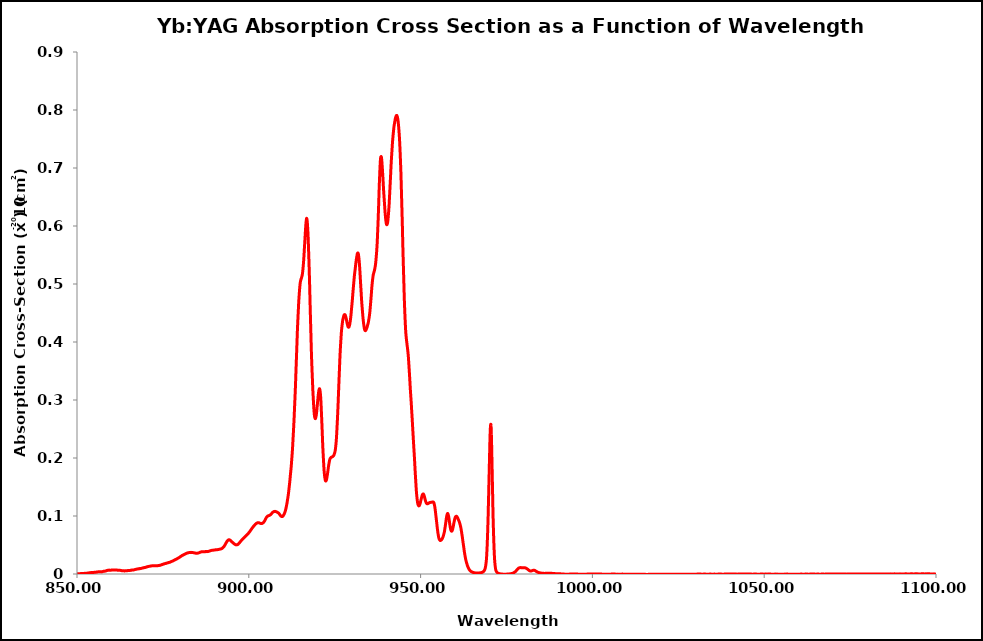
| Category | 80K |
|---|---|
| 850.0 | 0 |
| 850.05 | 0 |
| 850.1 | 0 |
| 850.15 | 0 |
| 850.2 | 0 |
| 850.25 | 0 |
| 850.3 | 0.001 |
| 850.35 | 0 |
| 850.4 | 0 |
| 850.45 | 0 |
| 850.5 | 0 |
| 850.55 | 0 |
| 850.6 | 0 |
| 850.65 | 0 |
| 850.7 | 0 |
| 850.75 | 0 |
| 850.8 | 0.001 |
| 850.85 | 0 |
| 850.9 | 0 |
| 850.95 | 0.001 |
| 851.0 | 0.001 |
| 851.05 | 0.001 |
| 851.1 | 0.001 |
| 851.15 | 0.001 |
| 851.2 | 0.001 |
| 851.25 | 0.001 |
| 851.3 | 0.001 |
| 851.35 | 0.001 |
| 851.4 | 0.001 |
| 851.45 | 0.001 |
| 851.5 | 0.001 |
| 851.55 | 0.001 |
| 851.6 | 0.001 |
| 851.65 | 0.001 |
| 851.7 | 0.001 |
| 851.75 | 0.001 |
| 851.8 | 0.001 |
| 851.85 | 0.001 |
| 851.9 | 0.001 |
| 851.95 | 0.001 |
| 852.0 | 0.001 |
| 852.05 | 0.001 |
| 852.1 | 0.001 |
| 852.15 | 0.001 |
| 852.2 | 0.001 |
| 852.25 | 0.001 |
| 852.3 | 0.001 |
| 852.35 | 0.001 |
| 852.4 | 0.001 |
| 852.45 | 0.001 |
| 852.5 | 0.001 |
| 852.55 | 0.001 |
| 852.6 | 0.001 |
| 852.65 | 0.001 |
| 852.7 | 0.001 |
| 852.75 | 0.001 |
| 852.8 | 0.001 |
| 852.85 | 0.001 |
| 852.9 | 0.001 |
| 852.95 | 0.001 |
| 853.0 | 0.001 |
| 853.05 | 0.001 |
| 853.1 | 0.002 |
| 853.15 | 0.002 |
| 853.2 | 0.002 |
| 853.25 | 0.002 |
| 853.3 | 0.002 |
| 853.35 | 0.002 |
| 853.4 | 0.002 |
| 853.45 | 0.002 |
| 853.5 | 0.002 |
| 853.55 | 0.002 |
| 853.6 | 0.002 |
| 853.65 | 0.002 |
| 853.7 | 0.002 |
| 853.75 | 0.002 |
| 853.8 | 0.002 |
| 853.85 | 0.002 |
| 853.9 | 0.002 |
| 853.95 | 0.002 |
| 854.0 | 0.002 |
| 854.05 | 0.002 |
| 854.1 | 0.002 |
| 854.15 | 0.002 |
| 854.2 | 0.002 |
| 854.25 | 0.002 |
| 854.3 | 0.003 |
| 854.35 | 0.002 |
| 854.4 | 0.002 |
| 854.45 | 0.002 |
| 854.5 | 0.002 |
| 854.55 | 0.002 |
| 854.6 | 0.003 |
| 854.65 | 0.003 |
| 854.7 | 0.002 |
| 854.75 | 0.003 |
| 854.8 | 0.003 |
| 854.85 | 0.003 |
| 854.9 | 0.003 |
| 854.95 | 0.003 |
| 855.0 | 0.003 |
| 855.05 | 0.003 |
| 855.1 | 0.003 |
| 855.15 | 0.003 |
| 855.2 | 0.003 |
| 855.25 | 0.003 |
| 855.3 | 0.003 |
| 855.35 | 0.003 |
| 855.4 | 0.003 |
| 855.45 | 0.003 |
| 855.5 | 0.003 |
| 855.55 | 0.003 |
| 855.6 | 0.003 |
| 855.65 | 0.003 |
| 855.7 | 0.003 |
| 855.75 | 0.003 |
| 855.8 | 0.003 |
| 855.85 | 0.004 |
| 855.9 | 0.003 |
| 855.95 | 0.004 |
| 856.0 | 0.004 |
| 856.05 | 0.004 |
| 856.1 | 0.004 |
| 856.15 | 0.004 |
| 856.2 | 0.004 |
| 856.25 | 0.004 |
| 856.3 | 0.004 |
| 856.35 | 0.004 |
| 856.4 | 0.004 |
| 856.45 | 0.004 |
| 856.5 | 0.004 |
| 856.55 | 0.004 |
| 856.6 | 0.004 |
| 856.65 | 0.004 |
| 856.7 | 0.004 |
| 856.75 | 0.004 |
| 856.8 | 0.004 |
| 856.85 | 0.004 |
| 856.9 | 0.004 |
| 856.95 | 0.004 |
| 857.0 | 0.004 |
| 857.05 | 0.004 |
| 857.1 | 0.004 |
| 857.15 | 0.004 |
| 857.2 | 0.004 |
| 857.25 | 0.004 |
| 857.3 | 0.004 |
| 857.35 | 0.004 |
| 857.4 | 0.004 |
| 857.45 | 0.004 |
| 857.5 | 0.004 |
| 857.55 | 0.004 |
| 857.6 | 0.004 |
| 857.65 | 0.004 |
| 857.7 | 0.005 |
| 857.75 | 0.005 |
| 857.8 | 0.005 |
| 857.85 | 0.005 |
| 857.9 | 0.005 |
| 857.95 | 0.005 |
| 858.0 | 0.005 |
| 858.05 | 0.005 |
| 858.1 | 0.005 |
| 858.15 | 0.005 |
| 858.2 | 0.005 |
| 858.25 | 0.005 |
| 858.3 | 0.005 |
| 858.35 | 0.005 |
| 858.4 | 0.005 |
| 858.45 | 0.005 |
| 858.5 | 0.006 |
| 858.55 | 0.006 |
| 858.6 | 0.006 |
| 858.65 | 0.006 |
| 858.7 | 0.006 |
| 858.75 | 0.006 |
| 858.8 | 0.006 |
| 858.85 | 0.006 |
| 858.9 | 0.006 |
| 858.95 | 0.006 |
| 859.0 | 0.007 |
| 859.05 | 0.007 |
| 859.1 | 0.006 |
| 859.15 | 0.007 |
| 859.2 | 0.007 |
| 859.25 | 0.007 |
| 859.3 | 0.007 |
| 859.35 | 0.007 |
| 859.4 | 0.007 |
| 859.45 | 0.007 |
| 859.5 | 0.007 |
| 859.55 | 0.007 |
| 859.6 | 0.007 |
| 859.65 | 0.007 |
| 859.7 | 0.006 |
| 859.75 | 0.007 |
| 859.8 | 0.007 |
| 859.85 | 0.007 |
| 859.9 | 0.007 |
| 859.95 | 0.007 |
| 860.0 | 0.007 |
| 860.05 | 0.007 |
| 860.1 | 0.007 |
| 860.15 | 0.007 |
| 860.2 | 0.007 |
| 860.25 | 0.007 |
| 860.3 | 0.007 |
| 860.35 | 0.007 |
| 860.4 | 0.007 |
| 860.45 | 0.007 |
| 860.5 | 0.007 |
| 860.55 | 0.007 |
| 860.6 | 0.007 |
| 860.65 | 0.007 |
| 860.7 | 0.007 |
| 860.75 | 0.007 |
| 860.8 | 0.007 |
| 860.85 | 0.007 |
| 860.9 | 0.007 |
| 860.95 | 0.007 |
| 861.0 | 0.007 |
| 861.05 | 0.007 |
| 861.1 | 0.007 |
| 861.15 | 0.007 |
| 861.2 | 0.007 |
| 861.25 | 0.007 |
| 861.3 | 0.007 |
| 861.35 | 0.007 |
| 861.4 | 0.007 |
| 861.45 | 0.007 |
| 861.5 | 0.007 |
| 861.55 | 0.007 |
| 861.6 | 0.007 |
| 861.65 | 0.007 |
| 861.7 | 0.007 |
| 861.75 | 0.007 |
| 861.8 | 0.007 |
| 861.85 | 0.007 |
| 861.9 | 0.007 |
| 861.95 | 0.007 |
| 862.0 | 0.007 |
| 862.05 | 0.007 |
| 862.1 | 0.007 |
| 862.15 | 0.006 |
| 862.2 | 0.006 |
| 862.25 | 0.006 |
| 862.3 | 0.006 |
| 862.35 | 0.006 |
| 862.4 | 0.006 |
| 862.45 | 0.006 |
| 862.5 | 0.006 |
| 862.55 | 0.006 |
| 862.6 | 0.006 |
| 862.65 | 0.006 |
| 862.7 | 0.006 |
| 862.75 | 0.006 |
| 862.8 | 0.006 |
| 862.85 | 0.006 |
| 862.9 | 0.006 |
| 862.95 | 0.006 |
| 863.0 | 0.006 |
| 863.05 | 0.006 |
| 863.1 | 0.006 |
| 863.15 | 0.006 |
| 863.2 | 0.006 |
| 863.25 | 0.006 |
| 863.3 | 0.006 |
| 863.35 | 0.006 |
| 863.4 | 0.006 |
| 863.45 | 0.006 |
| 863.5 | 0.005 |
| 863.55 | 0.005 |
| 863.6 | 0.005 |
| 863.65 | 0.005 |
| 863.7 | 0.005 |
| 863.75 | 0.005 |
| 863.8 | 0.005 |
| 863.85 | 0.005 |
| 863.9 | 0.005 |
| 863.95 | 0.005 |
| 864.0 | 0.006 |
| 864.05 | 0.006 |
| 864.1 | 0.005 |
| 864.15 | 0.005 |
| 864.2 | 0.005 |
| 864.25 | 0.005 |
| 864.3 | 0.005 |
| 864.35 | 0.005 |
| 864.4 | 0.006 |
| 864.45 | 0.006 |
| 864.5 | 0.006 |
| 864.55 | 0.006 |
| 864.6 | 0.006 |
| 864.65 | 0.006 |
| 864.7 | 0.006 |
| 864.75 | 0.006 |
| 864.8 | 0.006 |
| 864.85 | 0.006 |
| 864.9 | 0.006 |
| 864.95 | 0.006 |
| 865.0 | 0.006 |
| 865.05 | 0.006 |
| 865.1 | 0.006 |
| 865.15 | 0.006 |
| 865.2 | 0.006 |
| 865.25 | 0.006 |
| 865.3 | 0.006 |
| 865.35 | 0.006 |
| 865.4 | 0.006 |
| 865.45 | 0.006 |
| 865.5 | 0.006 |
| 865.55 | 0.006 |
| 865.6 | 0.006 |
| 865.65 | 0.006 |
| 865.7 | 0.006 |
| 865.75 | 0.007 |
| 865.8 | 0.007 |
| 865.85 | 0.007 |
| 865.9 | 0.007 |
| 865.95 | 0.007 |
| 866.0 | 0.007 |
| 866.05 | 0.007 |
| 866.1 | 0.007 |
| 866.15 | 0.007 |
| 866.2 | 0.007 |
| 866.25 | 0.007 |
| 866.3 | 0.007 |
| 866.35 | 0.007 |
| 866.4 | 0.007 |
| 866.45 | 0.007 |
| 866.5 | 0.007 |
| 866.55 | 0.007 |
| 866.6 | 0.007 |
| 866.65 | 0.007 |
| 866.7 | 0.007 |
| 866.75 | 0.007 |
| 866.8 | 0.008 |
| 866.85 | 0.008 |
| 866.9 | 0.008 |
| 866.95 | 0.008 |
| 867.0 | 0.008 |
| 867.05 | 0.008 |
| 867.1 | 0.008 |
| 867.15 | 0.008 |
| 867.2 | 0.008 |
| 867.25 | 0.008 |
| 867.3 | 0.008 |
| 867.35 | 0.008 |
| 867.4 | 0.008 |
| 867.45 | 0.008 |
| 867.5 | 0.009 |
| 867.55 | 0.009 |
| 867.6 | 0.009 |
| 867.65 | 0.009 |
| 867.7 | 0.009 |
| 867.75 | 0.009 |
| 867.8 | 0.009 |
| 867.85 | 0.009 |
| 867.9 | 0.009 |
| 867.95 | 0.009 |
| 868.0 | 0.009 |
| 868.05 | 0.009 |
| 868.1 | 0.009 |
| 868.15 | 0.009 |
| 868.2 | 0.009 |
| 868.25 | 0.009 |
| 868.3 | 0.009 |
| 868.35 | 0.009 |
| 868.4 | 0.009 |
| 868.45 | 0.009 |
| 868.5 | 0.009 |
| 868.55 | 0.01 |
| 868.6 | 0.01 |
| 868.65 | 0.01 |
| 868.7 | 0.01 |
| 868.75 | 0.01 |
| 868.8 | 0.01 |
| 868.85 | 0.01 |
| 868.9 | 0.01 |
| 868.95 | 0.01 |
| 869.0 | 0.01 |
| 869.05 | 0.01 |
| 869.1 | 0.01 |
| 869.15 | 0.01 |
| 869.2 | 0.01 |
| 869.25 | 0.011 |
| 869.3 | 0.011 |
| 869.35 | 0.011 |
| 869.4 | 0.011 |
| 869.45 | 0.011 |
| 869.5 | 0.011 |
| 869.55 | 0.011 |
| 869.6 | 0.011 |
| 869.65 | 0.011 |
| 869.7 | 0.011 |
| 869.75 | 0.011 |
| 869.8 | 0.011 |
| 869.85 | 0.011 |
| 869.9 | 0.011 |
| 869.95 | 0.012 |
| 870.0 | 0.012 |
| 870.05 | 0.012 |
| 870.1 | 0.012 |
| 870.15 | 0.012 |
| 870.2 | 0.012 |
| 870.25 | 0.012 |
| 870.3 | 0.012 |
| 870.35 | 0.012 |
| 870.4 | 0.012 |
| 870.45 | 0.013 |
| 870.5 | 0.013 |
| 870.55 | 0.013 |
| 870.6 | 0.013 |
| 870.65 | 0.013 |
| 870.7 | 0.013 |
| 870.75 | 0.013 |
| 870.8 | 0.013 |
| 870.85 | 0.013 |
| 870.9 | 0.013 |
| 870.95 | 0.013 |
| 871.0 | 0.013 |
| 871.05 | 0.013 |
| 871.1 | 0.013 |
| 871.15 | 0.013 |
| 871.2 | 0.013 |
| 871.25 | 0.013 |
| 871.3 | 0.014 |
| 871.35 | 0.014 |
| 871.4 | 0.014 |
| 871.45 | 0.014 |
| 871.5 | 0.014 |
| 871.55 | 0.014 |
| 871.6 | 0.014 |
| 871.65 | 0.014 |
| 871.7 | 0.014 |
| 871.75 | 0.014 |
| 871.8 | 0.014 |
| 871.85 | 0.014 |
| 871.9 | 0.014 |
| 871.95 | 0.014 |
| 872.0 | 0.014 |
| 872.05 | 0.014 |
| 872.1 | 0.014 |
| 872.15 | 0.014 |
| 872.2 | 0.014 |
| 872.25 | 0.014 |
| 872.3 | 0.014 |
| 872.35 | 0.014 |
| 872.4 | 0.014 |
| 872.45 | 0.014 |
| 872.5 | 0.014 |
| 872.55 | 0.014 |
| 872.6 | 0.014 |
| 872.65 | 0.014 |
| 872.7 | 0.014 |
| 872.75 | 0.014 |
| 872.8 | 0.014 |
| 872.85 | 0.014 |
| 872.9 | 0.014 |
| 872.95 | 0.014 |
| 873.0 | 0.014 |
| 873.05 | 0.014 |
| 873.1 | 0.014 |
| 873.15 | 0.014 |
| 873.2 | 0.014 |
| 873.25 | 0.014 |
| 873.3 | 0.014 |
| 873.35 | 0.014 |
| 873.4 | 0.014 |
| 873.45 | 0.014 |
| 873.5 | 0.014 |
| 873.55 | 0.014 |
| 873.6 | 0.014 |
| 873.65 | 0.014 |
| 873.7 | 0.015 |
| 873.75 | 0.015 |
| 873.8 | 0.015 |
| 873.85 | 0.015 |
| 873.9 | 0.015 |
| 873.95 | 0.015 |
| 874.0 | 0.015 |
| 874.05 | 0.015 |
| 874.1 | 0.015 |
| 874.15 | 0.015 |
| 874.2 | 0.015 |
| 874.25 | 0.015 |
| 874.3 | 0.015 |
| 874.35 | 0.015 |
| 874.4 | 0.016 |
| 874.45 | 0.016 |
| 874.5 | 0.016 |
| 874.55 | 0.016 |
| 874.6 | 0.016 |
| 874.65 | 0.016 |
| 874.7 | 0.016 |
| 874.75 | 0.016 |
| 874.8 | 0.016 |
| 874.85 | 0.016 |
| 874.9 | 0.017 |
| 874.95 | 0.017 |
| 875.0 | 0.017 |
| 875.05 | 0.017 |
| 875.1 | 0.017 |
| 875.15 | 0.017 |
| 875.2 | 0.017 |
| 875.25 | 0.017 |
| 875.3 | 0.017 |
| 875.35 | 0.017 |
| 875.4 | 0.018 |
| 875.45 | 0.018 |
| 875.5 | 0.018 |
| 875.55 | 0.018 |
| 875.6 | 0.018 |
| 875.65 | 0.018 |
| 875.7 | 0.018 |
| 875.75 | 0.018 |
| 875.8 | 0.018 |
| 875.85 | 0.018 |
| 875.9 | 0.018 |
| 875.95 | 0.019 |
| 876.0 | 0.019 |
| 876.05 | 0.019 |
| 876.1 | 0.019 |
| 876.15 | 0.019 |
| 876.2 | 0.019 |
| 876.25 | 0.019 |
| 876.3 | 0.019 |
| 876.35 | 0.019 |
| 876.4 | 0.019 |
| 876.45 | 0.019 |
| 876.5 | 0.019 |
| 876.55 | 0.019 |
| 876.6 | 0.02 |
| 876.65 | 0.02 |
| 876.7 | 0.02 |
| 876.75 | 0.02 |
| 876.8 | 0.02 |
| 876.85 | 0.02 |
| 876.9 | 0.02 |
| 876.95 | 0.02 |
| 877.0 | 0.02 |
| 877.05 | 0.02 |
| 877.1 | 0.02 |
| 877.15 | 0.021 |
| 877.2 | 0.021 |
| 877.25 | 0.021 |
| 877.3 | 0.021 |
| 877.35 | 0.021 |
| 877.4 | 0.021 |
| 877.45 | 0.021 |
| 877.5 | 0.022 |
| 877.55 | 0.022 |
| 877.6 | 0.022 |
| 877.65 | 0.022 |
| 877.7 | 0.022 |
| 877.75 | 0.022 |
| 877.8 | 0.022 |
| 877.85 | 0.022 |
| 877.9 | 0.023 |
| 877.95 | 0.023 |
| 878.0 | 0.023 |
| 878.05 | 0.023 |
| 878.1 | 0.023 |
| 878.15 | 0.023 |
| 878.2 | 0.024 |
| 878.25 | 0.024 |
| 878.3 | 0.024 |
| 878.35 | 0.024 |
| 878.4 | 0.024 |
| 878.45 | 0.024 |
| 878.5 | 0.024 |
| 878.55 | 0.025 |
| 878.6 | 0.025 |
| 878.65 | 0.025 |
| 878.7 | 0.025 |
| 878.75 | 0.025 |
| 878.8 | 0.025 |
| 878.85 | 0.026 |
| 878.9 | 0.026 |
| 878.95 | 0.026 |
| 879.0 | 0.026 |
| 879.05 | 0.026 |
| 879.1 | 0.026 |
| 879.15 | 0.026 |
| 879.2 | 0.027 |
| 879.25 | 0.027 |
| 879.3 | 0.027 |
| 879.35 | 0.027 |
| 879.4 | 0.027 |
| 879.45 | 0.027 |
| 879.5 | 0.028 |
| 879.55 | 0.028 |
| 879.6 | 0.028 |
| 879.65 | 0.028 |
| 879.7 | 0.028 |
| 879.75 | 0.028 |
| 879.8 | 0.029 |
| 879.85 | 0.029 |
| 879.9 | 0.029 |
| 879.95 | 0.029 |
| 880.0 | 0.029 |
| 880.05 | 0.03 |
| 880.1 | 0.03 |
| 880.15 | 0.03 |
| 880.2 | 0.03 |
| 880.25 | 0.031 |
| 880.3 | 0.031 |
| 880.35 | 0.031 |
| 880.4 | 0.031 |
| 880.45 | 0.031 |
| 880.5 | 0.031 |
| 880.55 | 0.032 |
| 880.6 | 0.032 |
| 880.65 | 0.032 |
| 880.7 | 0.032 |
| 880.75 | 0.032 |
| 880.8 | 0.032 |
| 880.85 | 0.033 |
| 880.9 | 0.033 |
| 880.95 | 0.033 |
| 881.0 | 0.033 |
| 881.05 | 0.033 |
| 881.1 | 0.033 |
| 881.15 | 0.034 |
| 881.2 | 0.034 |
| 881.25 | 0.034 |
| 881.3 | 0.034 |
| 881.35 | 0.034 |
| 881.4 | 0.034 |
| 881.45 | 0.034 |
| 881.5 | 0.035 |
| 881.55 | 0.035 |
| 881.6 | 0.035 |
| 881.65 | 0.035 |
| 881.7 | 0.035 |
| 881.75 | 0.035 |
| 881.8 | 0.035 |
| 881.85 | 0.036 |
| 881.9 | 0.036 |
| 881.95 | 0.036 |
| 882.0 | 0.036 |
| 882.05 | 0.036 |
| 882.1 | 0.036 |
| 882.15 | 0.036 |
| 882.2 | 0.036 |
| 882.25 | 0.036 |
| 882.3 | 0.036 |
| 882.35 | 0.037 |
| 882.4 | 0.037 |
| 882.45 | 0.037 |
| 882.5 | 0.037 |
| 882.55 | 0.037 |
| 882.6 | 0.037 |
| 882.65 | 0.037 |
| 882.7 | 0.037 |
| 882.75 | 0.037 |
| 882.8 | 0.037 |
| 882.85 | 0.037 |
| 882.9 | 0.037 |
| 882.95 | 0.037 |
| 883.0 | 0.037 |
| 883.05 | 0.037 |
| 883.1 | 0.037 |
| 883.15 | 0.037 |
| 883.2 | 0.037 |
| 883.25 | 0.037 |
| 883.3 | 0.037 |
| 883.35 | 0.037 |
| 883.4 | 0.037 |
| 883.45 | 0.037 |
| 883.5 | 0.037 |
| 883.55 | 0.037 |
| 883.6 | 0.037 |
| 883.65 | 0.037 |
| 883.7 | 0.037 |
| 883.75 | 0.037 |
| 883.8 | 0.037 |
| 883.85 | 0.037 |
| 883.9 | 0.037 |
| 883.95 | 0.037 |
| 884.0 | 0.037 |
| 884.05 | 0.037 |
| 884.1 | 0.036 |
| 884.15 | 0.036 |
| 884.2 | 0.036 |
| 884.25 | 0.036 |
| 884.3 | 0.036 |
| 884.35 | 0.036 |
| 884.4 | 0.036 |
| 884.45 | 0.036 |
| 884.5 | 0.036 |
| 884.55 | 0.036 |
| 884.6 | 0.036 |
| 884.65 | 0.036 |
| 884.7 | 0.036 |
| 884.75 | 0.036 |
| 884.8 | 0.036 |
| 884.85 | 0.036 |
| 884.9 | 0.036 |
| 884.95 | 0.036 |
| 885.0 | 0.036 |
| 885.05 | 0.036 |
| 885.1 | 0.036 |
| 885.15 | 0.036 |
| 885.2 | 0.036 |
| 885.25 | 0.036 |
| 885.3 | 0.036 |
| 885.35 | 0.036 |
| 885.4 | 0.036 |
| 885.45 | 0.037 |
| 885.5 | 0.037 |
| 885.55 | 0.037 |
| 885.6 | 0.037 |
| 885.65 | 0.037 |
| 885.7 | 0.037 |
| 885.75 | 0.037 |
| 885.8 | 0.037 |
| 885.85 | 0.037 |
| 885.9 | 0.038 |
| 885.95 | 0.038 |
| 886.0 | 0.038 |
| 886.05 | 0.038 |
| 886.1 | 0.038 |
| 886.15 | 0.038 |
| 886.2 | 0.038 |
| 886.25 | 0.038 |
| 886.3 | 0.038 |
| 886.35 | 0.038 |
| 886.4 | 0.038 |
| 886.45 | 0.038 |
| 886.5 | 0.038 |
| 886.55 | 0.038 |
| 886.6 | 0.038 |
| 886.65 | 0.038 |
| 886.7 | 0.038 |
| 886.75 | 0.039 |
| 886.8 | 0.039 |
| 886.85 | 0.038 |
| 886.9 | 0.039 |
| 886.95 | 0.039 |
| 887.0 | 0.039 |
| 887.05 | 0.039 |
| 887.1 | 0.039 |
| 887.15 | 0.039 |
| 887.2 | 0.039 |
| 887.25 | 0.039 |
| 887.3 | 0.039 |
| 887.35 | 0.039 |
| 887.4 | 0.039 |
| 887.45 | 0.039 |
| 887.5 | 0.039 |
| 887.55 | 0.039 |
| 887.6 | 0.039 |
| 887.65 | 0.039 |
| 887.7 | 0.039 |
| 887.75 | 0.039 |
| 887.8 | 0.039 |
| 887.85 | 0.039 |
| 887.9 | 0.039 |
| 887.95 | 0.039 |
| 888.0 | 0.039 |
| 888.05 | 0.039 |
| 888.1 | 0.039 |
| 888.15 | 0.039 |
| 888.2 | 0.039 |
| 888.25 | 0.039 |
| 888.3 | 0.039 |
| 888.35 | 0.039 |
| 888.4 | 0.039 |
| 888.45 | 0.039 |
| 888.5 | 0.039 |
| 888.55 | 0.04 |
| 888.6 | 0.04 |
| 888.65 | 0.04 |
| 888.7 | 0.04 |
| 888.75 | 0.04 |
| 888.8 | 0.04 |
| 888.85 | 0.04 |
| 888.9 | 0.04 |
| 888.95 | 0.04 |
| 889.0 | 0.04 |
| 889.05 | 0.041 |
| 889.1 | 0.041 |
| 889.15 | 0.041 |
| 889.2 | 0.041 |
| 889.25 | 0.041 |
| 889.3 | 0.041 |
| 889.35 | 0.041 |
| 889.4 | 0.041 |
| 889.45 | 0.041 |
| 889.5 | 0.041 |
| 889.55 | 0.041 |
| 889.6 | 0.041 |
| 889.65 | 0.041 |
| 889.7 | 0.041 |
| 889.75 | 0.041 |
| 889.8 | 0.041 |
| 889.85 | 0.041 |
| 889.9 | 0.041 |
| 889.95 | 0.041 |
| 890.0 | 0.041 |
| 890.05 | 0.041 |
| 890.1 | 0.041 |
| 890.15 | 0.042 |
| 890.2 | 0.042 |
| 890.25 | 0.042 |
| 890.3 | 0.042 |
| 890.35 | 0.042 |
| 890.4 | 0.042 |
| 890.45 | 0.042 |
| 890.5 | 0.042 |
| 890.55 | 0.042 |
| 890.6 | 0.042 |
| 890.65 | 0.042 |
| 890.7 | 0.042 |
| 890.75 | 0.042 |
| 890.8 | 0.042 |
| 890.85 | 0.042 |
| 890.9 | 0.042 |
| 890.95 | 0.042 |
| 891.0 | 0.042 |
| 891.05 | 0.042 |
| 891.1 | 0.042 |
| 891.15 | 0.042 |
| 891.2 | 0.042 |
| 891.25 | 0.042 |
| 891.3 | 0.042 |
| 891.35 | 0.043 |
| 891.4 | 0.043 |
| 891.45 | 0.043 |
| 891.5 | 0.043 |
| 891.55 | 0.043 |
| 891.6 | 0.043 |
| 891.65 | 0.043 |
| 891.7 | 0.043 |
| 891.75 | 0.043 |
| 891.8 | 0.043 |
| 891.85 | 0.043 |
| 891.9 | 0.043 |
| 891.95 | 0.043 |
| 892.0 | 0.043 |
| 892.05 | 0.044 |
| 892.1 | 0.044 |
| 892.15 | 0.044 |
| 892.2 | 0.044 |
| 892.25 | 0.044 |
| 892.3 | 0.044 |
| 892.35 | 0.045 |
| 892.4 | 0.045 |
| 892.45 | 0.045 |
| 892.5 | 0.046 |
| 892.55 | 0.046 |
| 892.6 | 0.046 |
| 892.65 | 0.046 |
| 892.7 | 0.047 |
| 892.75 | 0.047 |
| 892.8 | 0.047 |
| 892.85 | 0.048 |
| 892.9 | 0.048 |
| 892.95 | 0.049 |
| 893.0 | 0.049 |
| 893.05 | 0.05 |
| 893.1 | 0.05 |
| 893.15 | 0.051 |
| 893.2 | 0.051 |
| 893.25 | 0.052 |
| 893.3 | 0.053 |
| 893.35 | 0.053 |
| 893.4 | 0.054 |
| 893.45 | 0.054 |
| 893.5 | 0.055 |
| 893.55 | 0.055 |
| 893.6 | 0.056 |
| 893.65 | 0.056 |
| 893.7 | 0.057 |
| 893.75 | 0.057 |
| 893.8 | 0.057 |
| 893.85 | 0.058 |
| 893.9 | 0.058 |
| 893.95 | 0.058 |
| 894.0 | 0.059 |
| 894.05 | 0.059 |
| 894.1 | 0.059 |
| 894.15 | 0.059 |
| 894.2 | 0.059 |
| 894.25 | 0.059 |
| 894.3 | 0.059 |
| 894.35 | 0.059 |
| 894.4 | 0.059 |
| 894.45 | 0.059 |
| 894.5 | 0.059 |
| 894.55 | 0.058 |
| 894.6 | 0.058 |
| 894.65 | 0.058 |
| 894.7 | 0.058 |
| 894.75 | 0.057 |
| 894.8 | 0.057 |
| 894.85 | 0.057 |
| 894.9 | 0.057 |
| 894.95 | 0.056 |
| 895.0 | 0.056 |
| 895.05 | 0.056 |
| 895.1 | 0.055 |
| 895.15 | 0.055 |
| 895.2 | 0.055 |
| 895.25 | 0.055 |
| 895.3 | 0.054 |
| 895.35 | 0.054 |
| 895.4 | 0.054 |
| 895.45 | 0.054 |
| 895.5 | 0.053 |
| 895.55 | 0.053 |
| 895.6 | 0.053 |
| 895.65 | 0.053 |
| 895.7 | 0.052 |
| 895.75 | 0.052 |
| 895.8 | 0.052 |
| 895.85 | 0.052 |
| 895.9 | 0.051 |
| 895.95 | 0.051 |
| 896.0 | 0.051 |
| 896.05 | 0.051 |
| 896.1 | 0.051 |
| 896.15 | 0.051 |
| 896.2 | 0.05 |
| 896.25 | 0.05 |
| 896.3 | 0.05 |
| 896.35 | 0.05 |
| 896.4 | 0.05 |
| 896.45 | 0.05 |
| 896.5 | 0.05 |
| 896.55 | 0.05 |
| 896.6 | 0.05 |
| 896.65 | 0.05 |
| 896.7 | 0.051 |
| 896.75 | 0.051 |
| 896.8 | 0.051 |
| 896.85 | 0.051 |
| 896.9 | 0.051 |
| 896.95 | 0.052 |
| 897.0 | 0.052 |
| 897.05 | 0.052 |
| 897.1 | 0.053 |
| 897.15 | 0.053 |
| 897.2 | 0.053 |
| 897.25 | 0.054 |
| 897.3 | 0.054 |
| 897.35 | 0.054 |
| 897.4 | 0.055 |
| 897.45 | 0.055 |
| 897.5 | 0.055 |
| 897.55 | 0.056 |
| 897.6 | 0.056 |
| 897.65 | 0.057 |
| 897.7 | 0.057 |
| 897.75 | 0.057 |
| 897.8 | 0.058 |
| 897.85 | 0.058 |
| 897.9 | 0.058 |
| 897.95 | 0.058 |
| 898.0 | 0.059 |
| 898.05 | 0.059 |
| 898.1 | 0.059 |
| 898.15 | 0.06 |
| 898.2 | 0.06 |
| 898.25 | 0.06 |
| 898.3 | 0.061 |
| 898.35 | 0.061 |
| 898.4 | 0.061 |
| 898.45 | 0.061 |
| 898.5 | 0.062 |
| 898.55 | 0.062 |
| 898.6 | 0.062 |
| 898.65 | 0.063 |
| 898.7 | 0.063 |
| 898.75 | 0.063 |
| 898.8 | 0.064 |
| 898.85 | 0.064 |
| 898.9 | 0.064 |
| 898.95 | 0.064 |
| 899.0 | 0.065 |
| 899.05 | 0.065 |
| 899.1 | 0.065 |
| 899.15 | 0.066 |
| 899.2 | 0.066 |
| 899.25 | 0.066 |
| 899.3 | 0.066 |
| 899.35 | 0.067 |
| 899.4 | 0.067 |
| 899.45 | 0.067 |
| 899.5 | 0.068 |
| 899.55 | 0.068 |
| 899.6 | 0.068 |
| 899.65 | 0.069 |
| 899.7 | 0.069 |
| 899.75 | 0.069 |
| 899.8 | 0.07 |
| 899.85 | 0.07 |
| 899.9 | 0.07 |
| 899.95 | 0.071 |
| 900.0 | 0.071 |
| 900.05 | 0.072 |
| 900.1 | 0.072 |
| 900.15 | 0.072 |
| 900.2 | 0.073 |
| 900.25 | 0.073 |
| 900.3 | 0.073 |
| 900.35 | 0.074 |
| 900.4 | 0.074 |
| 900.45 | 0.075 |
| 900.5 | 0.075 |
| 900.55 | 0.075 |
| 900.6 | 0.076 |
| 900.65 | 0.076 |
| 900.7 | 0.077 |
| 900.75 | 0.077 |
| 900.8 | 0.078 |
| 900.85 | 0.078 |
| 900.9 | 0.078 |
| 900.95 | 0.079 |
| 901.0 | 0.079 |
| 901.05 | 0.08 |
| 901.1 | 0.08 |
| 901.15 | 0.081 |
| 901.2 | 0.081 |
| 901.25 | 0.081 |
| 901.3 | 0.082 |
| 901.35 | 0.082 |
| 901.4 | 0.082 |
| 901.45 | 0.083 |
| 901.5 | 0.083 |
| 901.55 | 0.083 |
| 901.6 | 0.084 |
| 901.65 | 0.084 |
| 901.7 | 0.084 |
| 901.75 | 0.085 |
| 901.8 | 0.085 |
| 901.85 | 0.085 |
| 901.9 | 0.086 |
| 901.95 | 0.086 |
| 902.0 | 0.086 |
| 902.05 | 0.087 |
| 902.1 | 0.087 |
| 902.15 | 0.087 |
| 902.2 | 0.087 |
| 902.25 | 0.087 |
| 902.3 | 0.088 |
| 902.35 | 0.088 |
| 902.4 | 0.088 |
| 902.45 | 0.088 |
| 902.5 | 0.088 |
| 902.55 | 0.088 |
| 902.6 | 0.088 |
| 902.65 | 0.088 |
| 902.7 | 0.088 |
| 902.75 | 0.088 |
| 902.8 | 0.088 |
| 902.85 | 0.088 |
| 902.9 | 0.088 |
| 902.95 | 0.088 |
| 903.0 | 0.088 |
| 903.05 | 0.088 |
| 903.1 | 0.088 |
| 903.15 | 0.088 |
| 903.2 | 0.088 |
| 903.25 | 0.088 |
| 903.3 | 0.088 |
| 903.35 | 0.087 |
| 903.4 | 0.087 |
| 903.45 | 0.087 |
| 903.5 | 0.087 |
| 903.55 | 0.087 |
| 903.6 | 0.087 |
| 903.65 | 0.087 |
| 903.7 | 0.087 |
| 903.75 | 0.087 |
| 903.8 | 0.087 |
| 903.85 | 0.087 |
| 903.9 | 0.087 |
| 903.95 | 0.087 |
| 904.0 | 0.088 |
| 904.05 | 0.088 |
| 904.1 | 0.088 |
| 904.15 | 0.088 |
| 904.2 | 0.088 |
| 904.25 | 0.089 |
| 904.3 | 0.089 |
| 904.35 | 0.089 |
| 904.4 | 0.09 |
| 904.45 | 0.09 |
| 904.5 | 0.091 |
| 904.55 | 0.091 |
| 904.6 | 0.091 |
| 904.65 | 0.092 |
| 904.7 | 0.092 |
| 904.75 | 0.093 |
| 904.8 | 0.094 |
| 904.85 | 0.094 |
| 904.9 | 0.095 |
| 904.95 | 0.096 |
| 905.0 | 0.096 |
| 905.05 | 0.097 |
| 905.1 | 0.097 |
| 905.15 | 0.098 |
| 905.2 | 0.098 |
| 905.25 | 0.099 |
| 905.3 | 0.099 |
| 905.35 | 0.099 |
| 905.4 | 0.099 |
| 905.45 | 0.1 |
| 905.5 | 0.1 |
| 905.55 | 0.1 |
| 905.6 | 0.1 |
| 905.65 | 0.1 |
| 905.7 | 0.1 |
| 905.75 | 0.101 |
| 905.8 | 0.101 |
| 905.85 | 0.101 |
| 905.9 | 0.101 |
| 905.95 | 0.101 |
| 906.0 | 0.101 |
| 906.05 | 0.101 |
| 906.1 | 0.101 |
| 906.15 | 0.102 |
| 906.2 | 0.102 |
| 906.25 | 0.102 |
| 906.3 | 0.102 |
| 906.35 | 0.103 |
| 906.4 | 0.103 |
| 906.45 | 0.103 |
| 906.5 | 0.103 |
| 906.55 | 0.104 |
| 906.6 | 0.104 |
| 906.65 | 0.104 |
| 906.7 | 0.105 |
| 906.75 | 0.105 |
| 906.8 | 0.105 |
| 906.85 | 0.106 |
| 906.9 | 0.106 |
| 906.95 | 0.106 |
| 907.0 | 0.106 |
| 907.05 | 0.107 |
| 907.1 | 0.107 |
| 907.15 | 0.107 |
| 907.2 | 0.107 |
| 907.25 | 0.107 |
| 907.3 | 0.108 |
| 907.35 | 0.108 |
| 907.4 | 0.108 |
| 907.45 | 0.108 |
| 907.5 | 0.108 |
| 907.55 | 0.108 |
| 907.6 | 0.108 |
| 907.65 | 0.108 |
| 907.7 | 0.108 |
| 907.75 | 0.108 |
| 907.8 | 0.108 |
| 907.85 | 0.108 |
| 907.9 | 0.108 |
| 907.95 | 0.107 |
| 908.0 | 0.107 |
| 908.05 | 0.107 |
| 908.1 | 0.107 |
| 908.15 | 0.107 |
| 908.2 | 0.107 |
| 908.25 | 0.107 |
| 908.3 | 0.106 |
| 908.35 | 0.106 |
| 908.4 | 0.106 |
| 908.45 | 0.106 |
| 908.5 | 0.106 |
| 908.55 | 0.105 |
| 908.6 | 0.105 |
| 908.65 | 0.105 |
| 908.7 | 0.105 |
| 908.75 | 0.104 |
| 908.8 | 0.104 |
| 908.85 | 0.104 |
| 908.9 | 0.103 |
| 908.95 | 0.103 |
| 909.0 | 0.102 |
| 909.05 | 0.102 |
| 909.1 | 0.102 |
| 909.15 | 0.101 |
| 909.2 | 0.101 |
| 909.25 | 0.101 |
| 909.3 | 0.1 |
| 909.35 | 0.1 |
| 909.4 | 0.1 |
| 909.45 | 0.099 |
| 909.5 | 0.099 |
| 909.55 | 0.099 |
| 909.6 | 0.099 |
| 909.65 | 0.099 |
| 909.7 | 0.099 |
| 909.75 | 0.099 |
| 909.8 | 0.099 |
| 909.85 | 0.099 |
| 909.9 | 0.1 |
| 909.95 | 0.1 |
| 910.0 | 0.1 |
| 910.05 | 0.101 |
| 910.1 | 0.101 |
| 910.15 | 0.102 |
| 910.2 | 0.102 |
| 910.25 | 0.103 |
| 910.3 | 0.103 |
| 910.35 | 0.104 |
| 910.4 | 0.105 |
| 910.45 | 0.106 |
| 910.5 | 0.106 |
| 910.55 | 0.107 |
| 910.6 | 0.108 |
| 910.65 | 0.109 |
| 910.7 | 0.11 |
| 910.75 | 0.111 |
| 910.8 | 0.113 |
| 910.85 | 0.114 |
| 910.9 | 0.116 |
| 910.95 | 0.117 |
| 911.0 | 0.119 |
| 911.05 | 0.12 |
| 911.1 | 0.122 |
| 911.15 | 0.123 |
| 911.2 | 0.125 |
| 911.25 | 0.127 |
| 911.3 | 0.129 |
| 911.35 | 0.131 |
| 911.4 | 0.133 |
| 911.45 | 0.135 |
| 911.5 | 0.137 |
| 911.55 | 0.139 |
| 911.6 | 0.142 |
| 911.65 | 0.144 |
| 911.7 | 0.147 |
| 911.75 | 0.149 |
| 911.8 | 0.152 |
| 911.85 | 0.155 |
| 911.9 | 0.158 |
| 911.95 | 0.161 |
| 912.0 | 0.164 |
| 912.05 | 0.167 |
| 912.1 | 0.17 |
| 912.15 | 0.173 |
| 912.2 | 0.176 |
| 912.25 | 0.179 |
| 912.3 | 0.182 |
| 912.35 | 0.186 |
| 912.4 | 0.19 |
| 912.45 | 0.194 |
| 912.5 | 0.198 |
| 912.55 | 0.201 |
| 912.6 | 0.205 |
| 912.65 | 0.21 |
| 912.7 | 0.214 |
| 912.75 | 0.219 |
| 912.8 | 0.224 |
| 912.85 | 0.23 |
| 912.9 | 0.236 |
| 912.95 | 0.241 |
| 913.0 | 0.247 |
| 913.05 | 0.252 |
| 913.1 | 0.258 |
| 913.15 | 0.264 |
| 913.2 | 0.27 |
| 913.25 | 0.278 |
| 913.3 | 0.285 |
| 913.35 | 0.291 |
| 913.4 | 0.298 |
| 913.45 | 0.305 |
| 913.5 | 0.312 |
| 913.55 | 0.319 |
| 913.6 | 0.327 |
| 913.65 | 0.336 |
| 913.7 | 0.345 |
| 913.75 | 0.354 |
| 913.8 | 0.362 |
| 913.85 | 0.37 |
| 913.9 | 0.378 |
| 913.95 | 0.387 |
| 914.0 | 0.395 |
| 914.05 | 0.404 |
| 914.1 | 0.413 |
| 914.15 | 0.421 |
| 914.2 | 0.428 |
| 914.25 | 0.434 |
| 914.3 | 0.441 |
| 914.35 | 0.447 |
| 914.4 | 0.453 |
| 914.45 | 0.459 |
| 914.5 | 0.465 |
| 914.55 | 0.471 |
| 914.6 | 0.476 |
| 914.65 | 0.48 |
| 914.7 | 0.484 |
| 914.75 | 0.488 |
| 914.8 | 0.492 |
| 914.85 | 0.496 |
| 914.9 | 0.498 |
| 914.95 | 0.501 |
| 915.0 | 0.503 |
| 915.05 | 0.505 |
| 915.1 | 0.506 |
| 915.15 | 0.507 |
| 915.2 | 0.508 |
| 915.25 | 0.509 |
| 915.3 | 0.51 |
| 915.35 | 0.511 |
| 915.4 | 0.512 |
| 915.45 | 0.513 |
| 915.5 | 0.514 |
| 915.55 | 0.515 |
| 915.6 | 0.517 |
| 915.65 | 0.519 |
| 915.7 | 0.522 |
| 915.75 | 0.525 |
| 915.8 | 0.528 |
| 915.85 | 0.532 |
| 915.9 | 0.535 |
| 915.95 | 0.539 |
| 916.0 | 0.543 |
| 916.05 | 0.548 |
| 916.1 | 0.553 |
| 916.15 | 0.559 |
| 916.2 | 0.563 |
| 916.25 | 0.568 |
| 916.3 | 0.573 |
| 916.35 | 0.578 |
| 916.4 | 0.584 |
| 916.45 | 0.588 |
| 916.5 | 0.594 |
| 916.55 | 0.598 |
| 916.6 | 0.602 |
| 916.65 | 0.606 |
| 916.7 | 0.608 |
| 916.75 | 0.611 |
| 916.8 | 0.613 |
| 916.85 | 0.613 |
| 916.9 | 0.612 |
| 916.95 | 0.611 |
| 917.0 | 0.608 |
| 917.05 | 0.605 |
| 917.1 | 0.6 |
| 917.15 | 0.595 |
| 917.2 | 0.59 |
| 917.25 | 0.584 |
| 917.3 | 0.576 |
| 917.35 | 0.567 |
| 917.4 | 0.558 |
| 917.45 | 0.549 |
| 917.5 | 0.54 |
| 917.55 | 0.531 |
| 917.6 | 0.521 |
| 917.65 | 0.511 |
| 917.7 | 0.5 |
| 917.75 | 0.488 |
| 917.8 | 0.475 |
| 917.85 | 0.463 |
| 917.9 | 0.452 |
| 917.95 | 0.441 |
| 918.0 | 0.43 |
| 918.05 | 0.419 |
| 918.1 | 0.408 |
| 918.15 | 0.397 |
| 918.2 | 0.386 |
| 918.25 | 0.376 |
| 918.3 | 0.368 |
| 918.35 | 0.36 |
| 918.4 | 0.352 |
| 918.45 | 0.345 |
| 918.5 | 0.338 |
| 918.55 | 0.33 |
| 918.6 | 0.322 |
| 918.65 | 0.316 |
| 918.7 | 0.31 |
| 918.75 | 0.304 |
| 918.8 | 0.299 |
| 918.85 | 0.293 |
| 918.9 | 0.288 |
| 918.95 | 0.284 |
| 919.0 | 0.28 |
| 919.05 | 0.276 |
| 919.1 | 0.273 |
| 919.15 | 0.272 |
| 919.2 | 0.27 |
| 919.25 | 0.269 |
| 919.3 | 0.268 |
| 919.35 | 0.268 |
| 919.4 | 0.268 |
| 919.45 | 0.269 |
| 919.5 | 0.27 |
| 919.55 | 0.271 |
| 919.6 | 0.273 |
| 919.65 | 0.275 |
| 919.7 | 0.277 |
| 919.75 | 0.28 |
| 919.8 | 0.282 |
| 919.85 | 0.286 |
| 919.9 | 0.289 |
| 919.95 | 0.292 |
| 920.0 | 0.295 |
| 920.05 | 0.298 |
| 920.1 | 0.301 |
| 920.15 | 0.305 |
| 920.2 | 0.308 |
| 920.25 | 0.31 |
| 920.3 | 0.313 |
| 920.35 | 0.315 |
| 920.4 | 0.317 |
| 920.45 | 0.318 |
| 920.5 | 0.319 |
| 920.55 | 0.32 |
| 920.6 | 0.319 |
| 920.65 | 0.319 |
| 920.7 | 0.317 |
| 920.75 | 0.315 |
| 920.8 | 0.313 |
| 920.85 | 0.31 |
| 920.9 | 0.306 |
| 920.95 | 0.302 |
| 921.0 | 0.296 |
| 921.05 | 0.29 |
| 921.1 | 0.283 |
| 921.15 | 0.276 |
| 921.2 | 0.27 |
| 921.25 | 0.262 |
| 921.3 | 0.255 |
| 921.35 | 0.248 |
| 921.4 | 0.24 |
| 921.45 | 0.232 |
| 921.5 | 0.224 |
| 921.55 | 0.218 |
| 921.6 | 0.212 |
| 921.65 | 0.206 |
| 921.7 | 0.2 |
| 921.75 | 0.195 |
| 921.8 | 0.189 |
| 921.85 | 0.184 |
| 921.9 | 0.18 |
| 921.95 | 0.176 |
| 922.0 | 0.173 |
| 922.05 | 0.17 |
| 922.1 | 0.168 |
| 922.15 | 0.165 |
| 922.2 | 0.164 |
| 922.25 | 0.162 |
| 922.3 | 0.161 |
| 922.35 | 0.16 |
| 922.4 | 0.16 |
| 922.45 | 0.16 |
| 922.5 | 0.161 |
| 922.55 | 0.162 |
| 922.6 | 0.163 |
| 922.65 | 0.164 |
| 922.7 | 0.165 |
| 922.75 | 0.167 |
| 922.8 | 0.169 |
| 922.85 | 0.171 |
| 922.9 | 0.173 |
| 922.95 | 0.175 |
| 923.0 | 0.177 |
| 923.05 | 0.179 |
| 923.1 | 0.181 |
| 923.15 | 0.184 |
| 923.2 | 0.186 |
| 923.25 | 0.188 |
| 923.3 | 0.189 |
| 923.35 | 0.191 |
| 923.4 | 0.193 |
| 923.45 | 0.194 |
| 923.5 | 0.196 |
| 923.55 | 0.197 |
| 923.6 | 0.198 |
| 923.65 | 0.199 |
| 923.7 | 0.199 |
| 923.75 | 0.2 |
| 923.8 | 0.2 |
| 923.85 | 0.2 |
| 923.9 | 0.201 |
| 923.95 | 0.201 |
| 924.0 | 0.201 |
| 924.05 | 0.201 |
| 924.1 | 0.201 |
| 924.15 | 0.202 |
| 924.2 | 0.202 |
| 924.25 | 0.202 |
| 924.3 | 0.202 |
| 924.35 | 0.202 |
| 924.4 | 0.202 |
| 924.45 | 0.203 |
| 924.5 | 0.203 |
| 924.55 | 0.203 |
| 924.6 | 0.204 |
| 924.65 | 0.204 |
| 924.7 | 0.204 |
| 924.75 | 0.205 |
| 924.8 | 0.205 |
| 924.85 | 0.206 |
| 924.9 | 0.207 |
| 924.95 | 0.208 |
| 925.0 | 0.209 |
| 925.05 | 0.21 |
| 925.1 | 0.211 |
| 925.15 | 0.213 |
| 925.2 | 0.215 |
| 925.25 | 0.218 |
| 925.3 | 0.22 |
| 925.35 | 0.223 |
| 925.4 | 0.226 |
| 925.45 | 0.23 |
| 925.5 | 0.234 |
| 925.55 | 0.238 |
| 925.6 | 0.244 |
| 925.65 | 0.25 |
| 925.7 | 0.256 |
| 925.75 | 0.261 |
| 925.8 | 0.267 |
| 925.85 | 0.274 |
| 925.9 | 0.28 |
| 925.95 | 0.287 |
| 926.0 | 0.295 |
| 926.05 | 0.303 |
| 926.1 | 0.311 |
| 926.15 | 0.318 |
| 926.2 | 0.325 |
| 926.25 | 0.333 |
| 926.3 | 0.341 |
| 926.35 | 0.348 |
| 926.4 | 0.356 |
| 926.45 | 0.363 |
| 926.5 | 0.371 |
| 926.55 | 0.377 |
| 926.6 | 0.383 |
| 926.65 | 0.389 |
| 926.7 | 0.394 |
| 926.75 | 0.399 |
| 926.8 | 0.404 |
| 926.85 | 0.408 |
| 926.9 | 0.413 |
| 926.95 | 0.417 |
| 927.0 | 0.421 |
| 927.05 | 0.424 |
| 927.1 | 0.426 |
| 927.15 | 0.429 |
| 927.2 | 0.431 |
| 927.25 | 0.434 |
| 927.3 | 0.436 |
| 927.35 | 0.438 |
| 927.4 | 0.439 |
| 927.45 | 0.441 |
| 927.5 | 0.442 |
| 927.55 | 0.443 |
| 927.6 | 0.444 |
| 927.65 | 0.445 |
| 927.7 | 0.446 |
| 927.75 | 0.447 |
| 927.8 | 0.447 |
| 927.85 | 0.447 |
| 927.9 | 0.447 |
| 927.95 | 0.447 |
| 928.0 | 0.447 |
| 928.05 | 0.447 |
| 928.1 | 0.446 |
| 928.15 | 0.445 |
| 928.2 | 0.444 |
| 928.25 | 0.443 |
| 928.3 | 0.442 |
| 928.35 | 0.44 |
| 928.4 | 0.439 |
| 928.45 | 0.437 |
| 928.5 | 0.436 |
| 928.55 | 0.434 |
| 928.6 | 0.433 |
| 928.65 | 0.431 |
| 928.7 | 0.43 |
| 928.75 | 0.429 |
| 928.8 | 0.428 |
| 928.85 | 0.427 |
| 928.9 | 0.426 |
| 928.95 | 0.426 |
| 929.0 | 0.425 |
| 929.05 | 0.425 |
| 929.1 | 0.426 |
| 929.15 | 0.426 |
| 929.2 | 0.427 |
| 929.25 | 0.427 |
| 929.3 | 0.428 |
| 929.35 | 0.43 |
| 929.4 | 0.431 |
| 929.45 | 0.433 |
| 929.5 | 0.435 |
| 929.55 | 0.437 |
| 929.6 | 0.44 |
| 929.65 | 0.442 |
| 929.7 | 0.445 |
| 929.75 | 0.447 |
| 929.8 | 0.451 |
| 929.85 | 0.454 |
| 929.9 | 0.457 |
| 929.95 | 0.46 |
| 930.0 | 0.464 |
| 930.05 | 0.467 |
| 930.1 | 0.47 |
| 930.15 | 0.473 |
| 930.2 | 0.477 |
| 930.25 | 0.481 |
| 930.3 | 0.485 |
| 930.35 | 0.489 |
| 930.4 | 0.492 |
| 930.45 | 0.495 |
| 930.5 | 0.499 |
| 930.55 | 0.502 |
| 930.6 | 0.505 |
| 930.65 | 0.509 |
| 930.7 | 0.512 |
| 930.75 | 0.515 |
| 930.8 | 0.518 |
| 930.85 | 0.52 |
| 930.9 | 0.523 |
| 930.95 | 0.525 |
| 931.0 | 0.528 |
| 931.05 | 0.53 |
| 931.1 | 0.533 |
| 931.15 | 0.536 |
| 931.2 | 0.538 |
| 931.25 | 0.54 |
| 931.3 | 0.542 |
| 931.35 | 0.544 |
| 931.4 | 0.546 |
| 931.45 | 0.548 |
| 931.5 | 0.55 |
| 931.55 | 0.551 |
| 931.6 | 0.552 |
| 931.65 | 0.553 |
| 931.7 | 0.553 |
| 931.75 | 0.553 |
| 931.8 | 0.553 |
| 931.85 | 0.553 |
| 931.9 | 0.551 |
| 931.95 | 0.549 |
| 932.0 | 0.547 |
| 932.05 | 0.544 |
| 932.1 | 0.541 |
| 932.15 | 0.538 |
| 932.2 | 0.534 |
| 932.25 | 0.53 |
| 932.3 | 0.526 |
| 932.35 | 0.521 |
| 932.4 | 0.515 |
| 932.45 | 0.51 |
| 932.5 | 0.505 |
| 932.55 | 0.5 |
| 932.6 | 0.495 |
| 932.65 | 0.49 |
| 932.7 | 0.485 |
| 932.75 | 0.48 |
| 932.8 | 0.475 |
| 932.85 | 0.47 |
| 932.9 | 0.466 |
| 932.95 | 0.462 |
| 933.0 | 0.459 |
| 933.05 | 0.455 |
| 933.1 | 0.451 |
| 933.15 | 0.448 |
| 933.2 | 0.444 |
| 933.25 | 0.441 |
| 933.3 | 0.438 |
| 933.35 | 0.435 |
| 933.4 | 0.433 |
| 933.45 | 0.43 |
| 933.5 | 0.428 |
| 933.55 | 0.426 |
| 933.6 | 0.424 |
| 933.65 | 0.423 |
| 933.7 | 0.422 |
| 933.75 | 0.421 |
| 933.8 | 0.42 |
| 933.85 | 0.42 |
| 933.9 | 0.42 |
| 933.95 | 0.42 |
| 934.0 | 0.42 |
| 934.05 | 0.42 |
| 934.1 | 0.421 |
| 934.15 | 0.421 |
| 934.2 | 0.422 |
| 934.25 | 0.423 |
| 934.3 | 0.424 |
| 934.35 | 0.424 |
| 934.4 | 0.425 |
| 934.45 | 0.426 |
| 934.5 | 0.427 |
| 934.55 | 0.428 |
| 934.6 | 0.43 |
| 934.65 | 0.431 |
| 934.7 | 0.432 |
| 934.75 | 0.433 |
| 934.8 | 0.434 |
| 934.85 | 0.436 |
| 934.9 | 0.438 |
| 934.95 | 0.439 |
| 935.0 | 0.441 |
| 935.05 | 0.443 |
| 935.1 | 0.445 |
| 935.15 | 0.448 |
| 935.2 | 0.45 |
| 935.25 | 0.453 |
| 935.3 | 0.456 |
| 935.35 | 0.46 |
| 935.4 | 0.463 |
| 935.45 | 0.467 |
| 935.5 | 0.47 |
| 935.55 | 0.474 |
| 935.6 | 0.478 |
| 935.65 | 0.482 |
| 935.7 | 0.486 |
| 935.75 | 0.49 |
| 935.8 | 0.494 |
| 935.85 | 0.497 |
| 935.9 | 0.5 |
| 935.95 | 0.503 |
| 936.0 | 0.506 |
| 936.05 | 0.509 |
| 936.1 | 0.511 |
| 936.15 | 0.513 |
| 936.2 | 0.515 |
| 936.25 | 0.517 |
| 936.3 | 0.518 |
| 936.35 | 0.519 |
| 936.4 | 0.52 |
| 936.45 | 0.521 |
| 936.5 | 0.522 |
| 936.55 | 0.523 |
| 936.6 | 0.524 |
| 936.65 | 0.526 |
| 936.7 | 0.527 |
| 936.75 | 0.529 |
| 936.8 | 0.531 |
| 936.85 | 0.533 |
| 936.9 | 0.535 |
| 936.95 | 0.537 |
| 937.0 | 0.541 |
| 937.05 | 0.544 |
| 937.1 | 0.548 |
| 937.15 | 0.551 |
| 937.2 | 0.555 |
| 937.25 | 0.559 |
| 937.3 | 0.564 |
| 937.35 | 0.569 |
| 937.4 | 0.575 |
| 937.45 | 0.582 |
| 937.5 | 0.59 |
| 937.55 | 0.597 |
| 937.6 | 0.604 |
| 937.65 | 0.611 |
| 937.7 | 0.62 |
| 937.75 | 0.628 |
| 937.8 | 0.637 |
| 937.85 | 0.647 |
| 937.9 | 0.657 |
| 937.95 | 0.666 |
| 938.0 | 0.674 |
| 938.05 | 0.681 |
| 938.1 | 0.689 |
| 938.15 | 0.696 |
| 938.2 | 0.703 |
| 938.25 | 0.709 |
| 938.3 | 0.713 |
| 938.35 | 0.717 |
| 938.4 | 0.719 |
| 938.45 | 0.719 |
| 938.5 | 0.72 |
| 938.55 | 0.72 |
| 938.6 | 0.718 |
| 938.65 | 0.716 |
| 938.7 | 0.713 |
| 938.75 | 0.71 |
| 938.8 | 0.705 |
| 938.85 | 0.701 |
| 938.9 | 0.696 |
| 938.95 | 0.691 |
| 939.0 | 0.687 |
| 939.05 | 0.681 |
| 939.1 | 0.676 |
| 939.15 | 0.67 |
| 939.2 | 0.665 |
| 939.25 | 0.66 |
| 939.3 | 0.656 |
| 939.35 | 0.651 |
| 939.4 | 0.646 |
| 939.45 | 0.642 |
| 939.5 | 0.638 |
| 939.55 | 0.633 |
| 939.6 | 0.629 |
| 939.65 | 0.625 |
| 939.7 | 0.621 |
| 939.75 | 0.618 |
| 939.8 | 0.615 |
| 939.85 | 0.611 |
| 939.9 | 0.609 |
| 939.95 | 0.607 |
| 940.0 | 0.605 |
| 940.05 | 0.603 |
| 940.1 | 0.603 |
| 940.15 | 0.602 |
| 940.2 | 0.602 |
| 940.25 | 0.603 |
| 940.3 | 0.604 |
| 940.35 | 0.605 |
| 940.4 | 0.606 |
| 940.45 | 0.608 |
| 940.5 | 0.611 |
| 940.55 | 0.614 |
| 940.6 | 0.617 |
| 940.65 | 0.621 |
| 940.7 | 0.625 |
| 940.75 | 0.629 |
| 940.8 | 0.633 |
| 940.85 | 0.638 |
| 940.9 | 0.644 |
| 940.95 | 0.65 |
| 941.0 | 0.656 |
| 941.05 | 0.661 |
| 941.1 | 0.668 |
| 941.15 | 0.673 |
| 941.2 | 0.679 |
| 941.25 | 0.685 |
| 941.3 | 0.691 |
| 941.35 | 0.698 |
| 941.4 | 0.704 |
| 941.45 | 0.709 |
| 941.5 | 0.715 |
| 941.55 | 0.72 |
| 941.6 | 0.724 |
| 941.65 | 0.728 |
| 941.7 | 0.733 |
| 941.75 | 0.738 |
| 941.8 | 0.743 |
| 941.85 | 0.747 |
| 941.9 | 0.75 |
| 941.95 | 0.753 |
| 942.0 | 0.757 |
| 942.05 | 0.76 |
| 942.1 | 0.763 |
| 942.15 | 0.766 |
| 942.2 | 0.769 |
| 942.25 | 0.771 |
| 942.3 | 0.773 |
| 942.35 | 0.775 |
| 942.4 | 0.777 |
| 942.45 | 0.779 |
| 942.5 | 0.78 |
| 942.55 | 0.782 |
| 942.6 | 0.784 |
| 942.65 | 0.785 |
| 942.7 | 0.786 |
| 942.75 | 0.787 |
| 942.8 | 0.788 |
| 942.85 | 0.789 |
| 942.9 | 0.79 |
| 942.95 | 0.79 |
| 943.0 | 0.79 |
| 943.05 | 0.79 |
| 943.1 | 0.79 |
| 943.15 | 0.789 |
| 943.2 | 0.789 |
| 943.25 | 0.788 |
| 943.3 | 0.786 |
| 943.35 | 0.785 |
| 943.4 | 0.783 |
| 943.45 | 0.781 |
| 943.5 | 0.778 |
| 943.55 | 0.775 |
| 943.6 | 0.772 |
| 943.65 | 0.768 |
| 943.7 | 0.765 |
| 943.75 | 0.76 |
| 943.8 | 0.756 |
| 943.85 | 0.752 |
| 943.9 | 0.746 |
| 943.95 | 0.739 |
| 944.0 | 0.733 |
| 944.05 | 0.726 |
| 944.1 | 0.719 |
| 944.15 | 0.711 |
| 944.2 | 0.703 |
| 944.25 | 0.696 |
| 944.3 | 0.686 |
| 944.35 | 0.675 |
| 944.4 | 0.664 |
| 944.45 | 0.654 |
| 944.5 | 0.643 |
| 944.55 | 0.632 |
| 944.6 | 0.621 |
| 944.65 | 0.61 |
| 944.7 | 0.599 |
| 944.75 | 0.586 |
| 944.8 | 0.573 |
| 944.85 | 0.561 |
| 944.9 | 0.55 |
| 944.95 | 0.539 |
| 945.0 | 0.528 |
| 945.05 | 0.518 |
| 945.1 | 0.508 |
| 945.15 | 0.498 |
| 945.2 | 0.487 |
| 945.25 | 0.476 |
| 945.3 | 0.468 |
| 945.35 | 0.459 |
| 945.4 | 0.452 |
| 945.45 | 0.445 |
| 945.5 | 0.438 |
| 945.55 | 0.432 |
| 945.6 | 0.425 |
| 945.65 | 0.42 |
| 945.7 | 0.415 |
| 945.75 | 0.412 |
| 945.8 | 0.409 |
| 945.85 | 0.406 |
| 945.9 | 0.403 |
| 945.95 | 0.401 |
| 946.0 | 0.398 |
| 946.05 | 0.396 |
| 946.1 | 0.393 |
| 946.15 | 0.391 |
| 946.2 | 0.389 |
| 946.25 | 0.386 |
| 946.3 | 0.383 |
| 946.35 | 0.38 |
| 946.4 | 0.377 |
| 946.45 | 0.374 |
| 946.5 | 0.369 |
| 946.55 | 0.365 |
| 946.6 | 0.36 |
| 946.65 | 0.355 |
| 946.7 | 0.35 |
| 946.75 | 0.346 |
| 946.8 | 0.341 |
| 946.85 | 0.336 |
| 946.9 | 0.33 |
| 946.95 | 0.325 |
| 947.0 | 0.32 |
| 947.05 | 0.315 |
| 947.1 | 0.311 |
| 947.15 | 0.306 |
| 947.2 | 0.302 |
| 947.25 | 0.297 |
| 947.3 | 0.293 |
| 947.35 | 0.287 |
| 947.4 | 0.282 |
| 947.45 | 0.277 |
| 947.5 | 0.273 |
| 947.55 | 0.268 |
| 947.6 | 0.262 |
| 947.65 | 0.257 |
| 947.7 | 0.252 |
| 947.75 | 0.246 |
| 947.8 | 0.241 |
| 947.85 | 0.236 |
| 947.9 | 0.231 |
| 947.95 | 0.226 |
| 948.0 | 0.221 |
| 948.05 | 0.216 |
| 948.1 | 0.211 |
| 948.15 | 0.206 |
| 948.2 | 0.201 |
| 948.25 | 0.196 |
| 948.3 | 0.19 |
| 948.35 | 0.184 |
| 948.4 | 0.179 |
| 948.45 | 0.174 |
| 948.5 | 0.169 |
| 948.55 | 0.164 |
| 948.6 | 0.159 |
| 948.65 | 0.154 |
| 948.7 | 0.149 |
| 948.75 | 0.144 |
| 948.8 | 0.141 |
| 948.85 | 0.137 |
| 948.9 | 0.134 |
| 948.95 | 0.131 |
| 949.0 | 0.129 |
| 949.05 | 0.126 |
| 949.1 | 0.124 |
| 949.15 | 0.122 |
| 949.2 | 0.121 |
| 949.25 | 0.12 |
| 949.3 | 0.119 |
| 949.35 | 0.118 |
| 949.4 | 0.118 |
| 949.45 | 0.118 |
| 949.5 | 0.117 |
| 949.55 | 0.118 |
| 949.6 | 0.118 |
| 949.65 | 0.118 |
| 949.7 | 0.119 |
| 949.75 | 0.12 |
| 949.8 | 0.12 |
| 949.85 | 0.121 |
| 949.9 | 0.122 |
| 949.95 | 0.124 |
| 950.0 | 0.125 |
| 950.05 | 0.126 |
| 950.1 | 0.127 |
| 950.15 | 0.129 |
| 950.2 | 0.13 |
| 950.25 | 0.131 |
| 950.3 | 0.132 |
| 950.35 | 0.133 |
| 950.4 | 0.134 |
| 950.45 | 0.135 |
| 950.5 | 0.136 |
| 950.55 | 0.137 |
| 950.6 | 0.137 |
| 950.65 | 0.138 |
| 950.7 | 0.138 |
| 950.75 | 0.138 |
| 950.8 | 0.138 |
| 950.85 | 0.138 |
| 950.9 | 0.137 |
| 950.95 | 0.136 |
| 951.0 | 0.135 |
| 951.05 | 0.135 |
| 951.1 | 0.134 |
| 951.15 | 0.132 |
| 951.2 | 0.131 |
| 951.25 | 0.13 |
| 951.3 | 0.129 |
| 951.35 | 0.128 |
| 951.4 | 0.127 |
| 951.45 | 0.126 |
| 951.5 | 0.125 |
| 951.55 | 0.124 |
| 951.6 | 0.123 |
| 951.65 | 0.123 |
| 951.7 | 0.122 |
| 951.75 | 0.122 |
| 951.8 | 0.121 |
| 951.85 | 0.121 |
| 951.9 | 0.121 |
| 951.95 | 0.121 |
| 952.0 | 0.121 |
| 952.05 | 0.121 |
| 952.1 | 0.121 |
| 952.15 | 0.121 |
| 952.2 | 0.122 |
| 952.25 | 0.122 |
| 952.3 | 0.122 |
| 952.35 | 0.122 |
| 952.4 | 0.122 |
| 952.45 | 0.123 |
| 952.5 | 0.123 |
| 952.55 | 0.123 |
| 952.6 | 0.123 |
| 952.65 | 0.123 |
| 952.7 | 0.123 |
| 952.75 | 0.123 |
| 952.8 | 0.123 |
| 952.85 | 0.123 |
| 952.9 | 0.123 |
| 952.95 | 0.123 |
| 953.0 | 0.123 |
| 953.05 | 0.123 |
| 953.1 | 0.124 |
| 953.15 | 0.124 |
| 953.2 | 0.124 |
| 953.25 | 0.124 |
| 953.3 | 0.124 |
| 953.35 | 0.124 |
| 953.4 | 0.124 |
| 953.45 | 0.124 |
| 953.5 | 0.124 |
| 953.55 | 0.124 |
| 953.6 | 0.124 |
| 953.65 | 0.124 |
| 953.7 | 0.124 |
| 953.75 | 0.124 |
| 953.8 | 0.123 |
| 953.85 | 0.123 |
| 953.9 | 0.122 |
| 953.95 | 0.121 |
| 954.0 | 0.12 |
| 954.05 | 0.118 |
| 954.1 | 0.117 |
| 954.15 | 0.115 |
| 954.2 | 0.113 |
| 954.25 | 0.111 |
| 954.3 | 0.109 |
| 954.35 | 0.106 |
| 954.4 | 0.103 |
| 954.45 | 0.101 |
| 954.5 | 0.098 |
| 954.55 | 0.096 |
| 954.6 | 0.093 |
| 954.65 | 0.09 |
| 954.7 | 0.088 |
| 954.75 | 0.085 |
| 954.8 | 0.082 |
| 954.85 | 0.08 |
| 954.9 | 0.077 |
| 954.95 | 0.075 |
| 955.0 | 0.073 |
| 955.05 | 0.071 |
| 955.1 | 0.069 |
| 955.15 | 0.067 |
| 955.2 | 0.065 |
| 955.25 | 0.064 |
| 955.3 | 0.062 |
| 955.35 | 0.061 |
| 955.4 | 0.06 |
| 955.45 | 0.06 |
| 955.5 | 0.059 |
| 955.55 | 0.059 |
| 955.6 | 0.058 |
| 955.65 | 0.058 |
| 955.7 | 0.058 |
| 955.75 | 0.058 |
| 955.8 | 0.058 |
| 955.85 | 0.058 |
| 955.9 | 0.058 |
| 955.95 | 0.058 |
| 956.0 | 0.058 |
| 956.05 | 0.059 |
| 956.1 | 0.059 |
| 956.15 | 0.06 |
| 956.2 | 0.06 |
| 956.25 | 0.06 |
| 956.3 | 0.061 |
| 956.35 | 0.062 |
| 956.4 | 0.062 |
| 956.45 | 0.063 |
| 956.5 | 0.064 |
| 956.55 | 0.065 |
| 956.6 | 0.065 |
| 956.65 | 0.066 |
| 956.7 | 0.067 |
| 956.75 | 0.069 |
| 956.8 | 0.07 |
| 956.85 | 0.071 |
| 956.9 | 0.072 |
| 956.95 | 0.074 |
| 957.0 | 0.076 |
| 957.05 | 0.077 |
| 957.1 | 0.079 |
| 957.15 | 0.081 |
| 957.2 | 0.083 |
| 957.25 | 0.085 |
| 957.3 | 0.088 |
| 957.35 | 0.09 |
| 957.4 | 0.092 |
| 957.45 | 0.094 |
| 957.5 | 0.096 |
| 957.55 | 0.098 |
| 957.6 | 0.1 |
| 957.65 | 0.101 |
| 957.7 | 0.102 |
| 957.75 | 0.103 |
| 957.8 | 0.104 |
| 957.85 | 0.104 |
| 957.9 | 0.104 |
| 957.95 | 0.104 |
| 958.0 | 0.103 |
| 958.05 | 0.102 |
| 958.1 | 0.101 |
| 958.15 | 0.099 |
| 958.2 | 0.098 |
| 958.25 | 0.096 |
| 958.3 | 0.094 |
| 958.35 | 0.092 |
| 958.4 | 0.09 |
| 958.45 | 0.088 |
| 958.5 | 0.086 |
| 958.55 | 0.084 |
| 958.6 | 0.082 |
| 958.65 | 0.08 |
| 958.7 | 0.079 |
| 958.75 | 0.077 |
| 958.8 | 0.076 |
| 958.85 | 0.075 |
| 958.9 | 0.075 |
| 958.95 | 0.074 |
| 959.0 | 0.074 |
| 959.05 | 0.074 |
| 959.1 | 0.074 |
| 959.15 | 0.074 |
| 959.2 | 0.075 |
| 959.25 | 0.076 |
| 959.3 | 0.077 |
| 959.35 | 0.078 |
| 959.4 | 0.079 |
| 959.45 | 0.08 |
| 959.5 | 0.082 |
| 959.55 | 0.083 |
| 959.6 | 0.085 |
| 959.65 | 0.087 |
| 959.7 | 0.088 |
| 959.75 | 0.09 |
| 959.8 | 0.091 |
| 959.85 | 0.093 |
| 959.9 | 0.094 |
| 959.95 | 0.095 |
| 960.0 | 0.096 |
| 960.05 | 0.097 |
| 960.1 | 0.098 |
| 960.15 | 0.098 |
| 960.2 | 0.099 |
| 960.25 | 0.099 |
| 960.3 | 0.099 |
| 960.35 | 0.1 |
| 960.4 | 0.1 |
| 960.45 | 0.099 |
| 960.5 | 0.099 |
| 960.55 | 0.099 |
| 960.6 | 0.099 |
| 960.65 | 0.098 |
| 960.7 | 0.098 |
| 960.75 | 0.097 |
| 960.8 | 0.096 |
| 960.85 | 0.096 |
| 960.9 | 0.095 |
| 960.95 | 0.094 |
| 961.0 | 0.094 |
| 961.05 | 0.093 |
| 961.1 | 0.092 |
| 961.15 | 0.092 |
| 961.2 | 0.091 |
| 961.25 | 0.09 |
| 961.3 | 0.089 |
| 961.35 | 0.088 |
| 961.4 | 0.087 |
| 961.45 | 0.086 |
| 961.5 | 0.085 |
| 961.55 | 0.084 |
| 961.6 | 0.083 |
| 961.65 | 0.082 |
| 961.7 | 0.08 |
| 961.75 | 0.079 |
| 961.8 | 0.077 |
| 961.85 | 0.075 |
| 961.9 | 0.073 |
| 961.95 | 0.071 |
| 962.0 | 0.069 |
| 962.05 | 0.067 |
| 962.1 | 0.066 |
| 962.15 | 0.064 |
| 962.2 | 0.061 |
| 962.25 | 0.059 |
| 962.3 | 0.057 |
| 962.35 | 0.055 |
| 962.4 | 0.053 |
| 962.45 | 0.051 |
| 962.5 | 0.048 |
| 962.55 | 0.046 |
| 962.6 | 0.044 |
| 962.65 | 0.042 |
| 962.7 | 0.04 |
| 962.75 | 0.038 |
| 962.8 | 0.036 |
| 962.85 | 0.034 |
| 962.9 | 0.032 |
| 962.95 | 0.031 |
| 963.0 | 0.029 |
| 963.05 | 0.028 |
| 963.1 | 0.026 |
| 963.15 | 0.024 |
| 963.2 | 0.023 |
| 963.25 | 0.022 |
| 963.3 | 0.021 |
| 963.35 | 0.02 |
| 963.4 | 0.019 |
| 963.45 | 0.018 |
| 963.5 | 0.017 |
| 963.55 | 0.016 |
| 963.6 | 0.015 |
| 963.65 | 0.014 |
| 963.7 | 0.013 |
| 963.75 | 0.013 |
| 963.8 | 0.012 |
| 963.85 | 0.011 |
| 963.9 | 0.011 |
| 963.95 | 0.01 |
| 964.0 | 0.009 |
| 964.05 | 0.009 |
| 964.1 | 0.008 |
| 964.15 | 0.008 |
| 964.2 | 0.007 |
| 964.25 | 0.007 |
| 964.3 | 0.007 |
| 964.35 | 0.006 |
| 964.4 | 0.006 |
| 964.45 | 0.006 |
| 964.5 | 0.005 |
| 964.55 | 0.005 |
| 964.6 | 0.005 |
| 964.65 | 0.005 |
| 964.7 | 0.004 |
| 964.75 | 0.004 |
| 964.8 | 0.004 |
| 964.85 | 0.004 |
| 964.9 | 0.004 |
| 964.95 | 0.003 |
| 965.0 | 0.003 |
| 965.05 | 0.003 |
| 965.1 | 0.003 |
| 965.15 | 0.003 |
| 965.2 | 0.003 |
| 965.25 | 0.003 |
| 965.3 | 0.003 |
| 965.35 | 0.003 |
| 965.4 | 0.002 |
| 965.45 | 0.002 |
| 965.5 | 0.002 |
| 965.55 | 0.002 |
| 965.6 | 0.002 |
| 965.65 | 0.002 |
| 965.7 | 0.002 |
| 965.75 | 0.002 |
| 965.8 | 0.002 |
| 965.85 | 0.002 |
| 965.9 | 0.002 |
| 965.95 | 0.002 |
| 966.0 | 0.002 |
| 966.05 | 0.002 |
| 966.1 | 0.002 |
| 966.15 | 0.002 |
| 966.2 | 0.002 |
| 966.25 | 0.002 |
| 966.3 | 0.002 |
| 966.35 | 0.002 |
| 966.4 | 0.002 |
| 966.45 | 0.002 |
| 966.5 | 0.002 |
| 966.55 | 0.002 |
| 966.6 | 0.002 |
| 966.65 | 0.002 |
| 966.7 | 0.002 |
| 966.75 | 0.002 |
| 966.8 | 0.002 |
| 966.85 | 0.002 |
| 966.9 | 0.002 |
| 966.95 | 0.002 |
| 967.0 | 0.002 |
| 967.05 | 0.002 |
| 967.1 | 0.002 |
| 967.15 | 0.002 |
| 967.2 | 0.002 |
| 967.25 | 0.002 |
| 967.3 | 0.002 |
| 967.35 | 0.002 |
| 967.4 | 0.002 |
| 967.45 | 0.002 |
| 967.5 | 0.002 |
| 967.55 | 0.002 |
| 967.6 | 0.002 |
| 967.65 | 0.002 |
| 967.7 | 0.002 |
| 967.75 | 0.003 |
| 967.8 | 0.003 |
| 967.85 | 0.003 |
| 967.9 | 0.003 |
| 967.95 | 0.003 |
| 968.0 | 0.003 |
| 968.05 | 0.003 |
| 968.1 | 0.003 |
| 968.15 | 0.004 |
| 968.2 | 0.004 |
| 968.25 | 0.004 |
| 968.3 | 0.004 |
| 968.35 | 0.005 |
| 968.4 | 0.005 |
| 968.45 | 0.005 |
| 968.5 | 0.006 |
| 968.55 | 0.006 |
| 968.6 | 0.007 |
| 968.65 | 0.007 |
| 968.7 | 0.008 |
| 968.75 | 0.009 |
| 968.8 | 0.01 |
| 968.85 | 0.011 |
| 968.9 | 0.013 |
| 968.95 | 0.015 |
| 969.0 | 0.017 |
| 969.05 | 0.019 |
| 969.1 | 0.021 |
| 969.15 | 0.024 |
| 969.2 | 0.028 |
| 969.25 | 0.034 |
| 969.3 | 0.039 |
| 969.35 | 0.046 |
| 969.4 | 0.053 |
| 969.45 | 0.061 |
| 969.5 | 0.069 |
| 969.55 | 0.079 |
| 969.6 | 0.088 |
| 969.65 | 0.099 |
| 969.7 | 0.111 |
| 969.75 | 0.123 |
| 969.8 | 0.135 |
| 969.85 | 0.148 |
| 969.9 | 0.16 |
| 969.95 | 0.173 |
| 970.0 | 0.186 |
| 970.05 | 0.198 |
| 970.1 | 0.211 |
| 970.15 | 0.224 |
| 970.2 | 0.236 |
| 970.25 | 0.244 |
| 970.3 | 0.251 |
| 970.35 | 0.256 |
| 970.4 | 0.258 |
| 970.45 | 0.258 |
| 970.5 | 0.256 |
| 970.55 | 0.25 |
| 970.6 | 0.24 |
| 970.65 | 0.228 |
| 970.7 | 0.215 |
| 970.75 | 0.2 |
| 970.8 | 0.186 |
| 970.85 | 0.171 |
| 970.9 | 0.156 |
| 970.95 | 0.142 |
| 971.0 | 0.126 |
| 971.05 | 0.111 |
| 971.1 | 0.098 |
| 971.15 | 0.086 |
| 971.2 | 0.076 |
| 971.25 | 0.066 |
| 971.3 | 0.058 |
| 971.35 | 0.049 |
| 971.4 | 0.042 |
| 971.45 | 0.035 |
| 971.5 | 0.028 |
| 971.55 | 0.024 |
| 971.6 | 0.02 |
| 971.65 | 0.017 |
| 971.7 | 0.014 |
| 971.75 | 0.012 |
| 971.8 | 0.01 |
| 971.85 | 0.008 |
| 971.9 | 0.007 |
| 971.95 | 0.006 |
| 972.0 | 0.005 |
| 972.05 | 0.004 |
| 972.1 | 0.004 |
| 972.15 | 0.003 |
| 972.2 | 0.003 |
| 972.25 | 0.003 |
| 972.3 | 0.002 |
| 972.35 | 0.002 |
| 972.4 | 0.002 |
| 972.45 | 0.002 |
| 972.5 | 0.002 |
| 972.55 | 0.001 |
| 972.6 | 0.001 |
| 972.65 | 0.001 |
| 972.7 | 0.001 |
| 972.75 | 0.001 |
| 972.8 | 0.001 |
| 972.85 | 0.001 |
| 972.9 | 0.001 |
| 972.95 | 0.001 |
| 973.0 | 0.001 |
| 973.05 | 0 |
| 973.1 | 0 |
| 973.15 | 0 |
| 973.2 | 0 |
| 973.25 | 0 |
| 973.3 | 0 |
| 973.35 | 0 |
| 973.4 | 0 |
| 973.45 | 0 |
| 973.5 | 0 |
| 973.55 | 0 |
| 973.6 | 0 |
| 973.65 | 0 |
| 973.7 | 0 |
| 973.75 | 0 |
| 973.8 | 0 |
| 973.85 | 0 |
| 973.9 | 0 |
| 973.95 | 0 |
| 974.0 | 0 |
| 974.05 | 0 |
| 974.1 | 0 |
| 974.15 | 0 |
| 974.2 | 0 |
| 974.25 | 0 |
| 974.3 | 0 |
| 974.35 | 0 |
| 974.4 | 0 |
| 974.45 | 0 |
| 974.5 | 0 |
| 974.55 | 0 |
| 974.6 | 0 |
| 974.65 | 0 |
| 974.7 | 0 |
| 974.75 | 0 |
| 974.8 | 0 |
| 974.85 | 0 |
| 974.9 | 0 |
| 974.95 | 0 |
| 975.0 | 0 |
| 975.05 | 0 |
| 975.1 | 0 |
| 975.15 | 0 |
| 975.2 | 0 |
| 975.25 | 0 |
| 975.3 | 0 |
| 975.35 | 0 |
| 975.4 | 0 |
| 975.45 | 0 |
| 975.5 | 0 |
| 975.55 | 0 |
| 975.6 | 0 |
| 975.65 | 0 |
| 975.7 | 0 |
| 975.75 | 0 |
| 975.8 | 0 |
| 975.85 | 0 |
| 975.9 | 0 |
| 975.95 | 0 |
| 976.0 | 0 |
| 976.05 | 0 |
| 976.1 | 0 |
| 976.15 | 0 |
| 976.2 | 0.001 |
| 976.25 | 0.001 |
| 976.3 | 0.001 |
| 976.35 | 0.001 |
| 976.4 | 0.001 |
| 976.45 | 0.001 |
| 976.5 | 0.001 |
| 976.55 | 0.001 |
| 976.6 | 0.001 |
| 976.65 | 0.001 |
| 976.7 | 0.001 |
| 976.75 | 0.001 |
| 976.8 | 0.001 |
| 976.85 | 0.001 |
| 976.9 | 0.002 |
| 976.95 | 0.002 |
| 977.0 | 0.002 |
| 977.05 | 0.002 |
| 977.1 | 0.002 |
| 977.15 | 0.002 |
| 977.2 | 0.003 |
| 977.25 | 0.003 |
| 977.3 | 0.003 |
| 977.35 | 0.003 |
| 977.4 | 0.003 |
| 977.45 | 0.004 |
| 977.5 | 0.004 |
| 977.55 | 0.004 |
| 977.6 | 0.004 |
| 977.65 | 0.005 |
| 977.7 | 0.005 |
| 977.75 | 0.005 |
| 977.8 | 0.006 |
| 977.85 | 0.006 |
| 977.9 | 0.006 |
| 977.95 | 0.007 |
| 978.0 | 0.007 |
| 978.05 | 0.007 |
| 978.1 | 0.008 |
| 978.15 | 0.008 |
| 978.2 | 0.008 |
| 978.25 | 0.009 |
| 978.3 | 0.009 |
| 978.35 | 0.009 |
| 978.4 | 0.009 |
| 978.45 | 0.01 |
| 978.5 | 0.01 |
| 978.55 | 0.01 |
| 978.6 | 0.01 |
| 978.65 | 0.01 |
| 978.7 | 0.011 |
| 978.75 | 0.011 |
| 978.8 | 0.011 |
| 978.85 | 0.011 |
| 978.9 | 0.011 |
| 978.95 | 0.011 |
| 979.0 | 0.011 |
| 979.05 | 0.011 |
| 979.1 | 0.011 |
| 979.15 | 0.011 |
| 979.2 | 0.011 |
| 979.25 | 0.011 |
| 979.3 | 0.011 |
| 979.35 | 0.011 |
| 979.4 | 0.011 |
| 979.45 | 0.011 |
| 979.5 | 0.011 |
| 979.55 | 0.011 |
| 979.6 | 0.011 |
| 979.65 | 0.011 |
| 979.7 | 0.011 |
| 979.75 | 0.011 |
| 979.8 | 0.011 |
| 979.85 | 0.011 |
| 979.9 | 0.011 |
| 979.95 | 0.011 |
| 980.0 | 0.011 |
| 980.05 | 0.011 |
| 980.1 | 0.011 |
| 980.15 | 0.011 |
| 980.2 | 0.011 |
| 980.25 | 0.011 |
| 980.3 | 0.011 |
| 980.35 | 0.011 |
| 980.4 | 0.011 |
| 980.45 | 0.011 |
| 980.5 | 0.01 |
| 980.55 | 0.01 |
| 980.6 | 0.01 |
| 980.65 | 0.01 |
| 980.7 | 0.01 |
| 980.75 | 0.01 |
| 980.8 | 0.01 |
| 980.85 | 0.009 |
| 980.9 | 0.009 |
| 980.95 | 0.009 |
| 981.0 | 0.009 |
| 981.05 | 0.009 |
| 981.1 | 0.008 |
| 981.15 | 0.008 |
| 981.2 | 0.008 |
| 981.25 | 0.008 |
| 981.3 | 0.008 |
| 981.35 | 0.007 |
| 981.4 | 0.007 |
| 981.45 | 0.007 |
| 981.5 | 0.007 |
| 981.55 | 0.006 |
| 981.6 | 0.006 |
| 981.65 | 0.006 |
| 981.7 | 0.006 |
| 981.75 | 0.006 |
| 981.8 | 0.005 |
| 981.85 | 0.005 |
| 981.9 | 0.005 |
| 981.95 | 0.005 |
| 982.0 | 0.005 |
| 982.05 | 0.005 |
| 982.1 | 0.005 |
| 982.15 | 0.005 |
| 982.2 | 0.005 |
| 982.25 | 0.005 |
| 982.3 | 0.005 |
| 982.35 | 0.005 |
| 982.4 | 0.006 |
| 982.45 | 0.006 |
| 982.5 | 0.006 |
| 982.55 | 0.006 |
| 982.6 | 0.006 |
| 982.65 | 0.006 |
| 982.7 | 0.006 |
| 982.75 | 0.006 |
| 982.8 | 0.006 |
| 982.85 | 0.006 |
| 982.9 | 0.006 |
| 982.95 | 0.006 |
| 983.0 | 0.006 |
| 983.05 | 0.006 |
| 983.1 | 0.006 |
| 983.15 | 0.006 |
| 983.2 | 0.006 |
| 983.25 | 0.006 |
| 983.3 | 0.006 |
| 983.35 | 0.006 |
| 983.4 | 0.006 |
| 983.45 | 0.005 |
| 983.5 | 0.005 |
| 983.55 | 0.005 |
| 983.6 | 0.005 |
| 983.65 | 0.005 |
| 983.7 | 0.004 |
| 983.75 | 0.004 |
| 983.8 | 0.004 |
| 983.85 | 0.004 |
| 983.9 | 0.004 |
| 983.95 | 0.004 |
| 984.0 | 0.003 |
| 984.05 | 0.003 |
| 984.1 | 0.003 |
| 984.15 | 0.003 |
| 984.2 | 0.003 |
| 984.25 | 0.003 |
| 984.3 | 0.003 |
| 984.35 | 0.003 |
| 984.4 | 0.002 |
| 984.45 | 0.002 |
| 984.5 | 0.002 |
| 984.55 | 0.002 |
| 984.6 | 0.002 |
| 984.65 | 0.002 |
| 984.7 | 0.002 |
| 984.75 | 0.002 |
| 984.8 | 0.002 |
| 984.85 | 0.002 |
| 984.9 | 0.002 |
| 984.95 | 0.002 |
| 985.0 | 0.002 |
| 985.05 | 0.002 |
| 985.1 | 0.002 |
| 985.15 | 0.002 |
| 985.2 | 0.001 |
| 985.25 | 0.001 |
| 985.3 | 0.001 |
| 985.35 | 0.001 |
| 985.4 | 0.001 |
| 985.45 | 0.001 |
| 985.5 | 0.001 |
| 985.55 | 0.001 |
| 985.6 | 0.001 |
| 985.65 | 0.001 |
| 985.7 | 0.001 |
| 985.75 | 0.001 |
| 985.8 | 0.001 |
| 985.85 | 0.001 |
| 985.9 | 0.001 |
| 985.95 | 0.001 |
| 986.0 | 0.001 |
| 986.05 | 0.001 |
| 986.1 | 0.001 |
| 986.15 | 0.001 |
| 986.2 | 0.001 |
| 986.25 | 0.001 |
| 986.3 | 0.001 |
| 986.35 | 0.001 |
| 986.4 | 0.001 |
| 986.45 | 0.001 |
| 986.5 | 0.001 |
| 986.55 | 0.001 |
| 986.6 | 0.001 |
| 986.65 | 0.001 |
| 986.7 | 0.001 |
| 986.75 | 0.001 |
| 986.8 | 0.001 |
| 986.85 | 0.001 |
| 986.9 | 0.001 |
| 986.95 | 0.001 |
| 987.0 | 0.001 |
| 987.05 | 0.001 |
| 987.1 | 0.001 |
| 987.15 | 0.001 |
| 987.2 | 0.001 |
| 987.25 | 0.001 |
| 987.3 | 0.001 |
| 987.35 | 0.001 |
| 987.4 | 0.001 |
| 987.45 | 0.001 |
| 987.5 | 0.001 |
| 987.55 | 0.001 |
| 987.6 | 0.001 |
| 987.65 | 0.001 |
| 987.7 | 0.001 |
| 987.75 | 0.001 |
| 987.8 | 0.001 |
| 987.85 | 0.001 |
| 987.9 | 0.001 |
| 987.95 | 0.001 |
| 988.0 | 0.001 |
| 988.05 | 0.001 |
| 988.1 | 0.001 |
| 988.15 | 0.001 |
| 988.2 | 0.001 |
| 988.25 | 0.001 |
| 988.3 | 0.001 |
| 988.35 | 0.001 |
| 988.4 | 0.001 |
| 988.45 | 0.001 |
| 988.5 | 0.001 |
| 988.55 | 0.001 |
| 988.6 | 0.001 |
| 988.65 | 0.001 |
| 988.7 | 0.001 |
| 988.75 | 0.001 |
| 988.8 | 0.001 |
| 988.85 | 0.001 |
| 988.9 | 0.001 |
| 988.95 | 0.001 |
| 989.0 | 0.001 |
| 989.05 | 0.001 |
| 989.1 | 0.001 |
| 989.15 | 0.001 |
| 989.2 | 0.001 |
| 989.25 | 0.001 |
| 989.3 | 0.001 |
| 989.35 | 0.001 |
| 989.4 | 0.001 |
| 989.45 | 0.001 |
| 989.5 | 0.001 |
| 989.55 | 0 |
| 989.6 | 0 |
| 989.65 | 0 |
| 989.7 | 0 |
| 989.75 | 0 |
| 989.8 | 0 |
| 989.85 | 0 |
| 989.9 | 0 |
| 989.95 | 0 |
| 990.0 | 0 |
| 990.05 | 0 |
| 990.1 | 0 |
| 990.15 | 0 |
| 990.2 | 0 |
| 990.25 | 0 |
| 990.3 | 0 |
| 990.35 | 0 |
| 990.4 | 0 |
| 990.45 | 0 |
| 990.5 | 0 |
| 990.55 | 0 |
| 990.6 | 0 |
| 990.65 | 0 |
| 990.7 | 0 |
| 990.75 | 0 |
| 990.8 | 0 |
| 990.85 | 0 |
| 990.9 | 0 |
| 990.95 | 0 |
| 991.0 | 0 |
| 991.05 | 0 |
| 991.1 | 0 |
| 991.15 | 0 |
| 991.2 | 0 |
| 991.25 | 0 |
| 991.3 | 0 |
| 991.35 | 0 |
| 991.4 | 0 |
| 991.45 | 0 |
| 991.5 | 0 |
| 991.55 | 0 |
| 991.6 | 0 |
| 991.65 | 0 |
| 991.7 | 0 |
| 991.75 | 0 |
| 991.8 | 0 |
| 991.85 | 0 |
| 991.9 | 0 |
| 991.95 | 0 |
| 992.0 | 0 |
| 992.05 | 0 |
| 992.1 | 0 |
| 992.15 | 0 |
| 992.2 | 0 |
| 992.25 | 0 |
| 992.3 | 0 |
| 992.35 | 0 |
| 992.4 | 0 |
| 992.45 | 0 |
| 992.5 | 0 |
| 992.55 | 0 |
| 992.6 | 0 |
| 992.65 | 0 |
| 992.7 | 0 |
| 992.75 | 0 |
| 992.8 | 0 |
| 992.85 | 0 |
| 992.9 | 0 |
| 992.95 | 0 |
| 993.0 | 0 |
| 993.05 | 0 |
| 993.1 | 0 |
| 993.15 | 0 |
| 993.2 | 0 |
| 993.25 | 0 |
| 993.3 | 0 |
| 993.35 | 0 |
| 993.4 | 0 |
| 993.45 | 0 |
| 993.5 | 0 |
| 993.55 | 0 |
| 993.6 | 0 |
| 993.65 | 0 |
| 993.7 | 0 |
| 993.75 | 0 |
| 993.8 | 0 |
| 993.85 | 0 |
| 993.9 | 0 |
| 993.95 | 0 |
| 994.0 | 0 |
| 994.05 | 0 |
| 994.1 | 0 |
| 994.15 | 0 |
| 994.2 | 0 |
| 994.25 | 0 |
| 994.3 | 0 |
| 994.35 | 0 |
| 994.4 | 0 |
| 994.45 | 0 |
| 994.5 | 0 |
| 994.55 | 0 |
| 994.6 | 0 |
| 994.65 | 0 |
| 994.7 | 0 |
| 994.75 | 0 |
| 994.8 | 0 |
| 994.85 | 0 |
| 994.9 | 0 |
| 994.95 | 0 |
| 995.0 | 0 |
| 995.05 | 0 |
| 995.1 | 0 |
| 995.15 | 0 |
| 995.2 | 0 |
| 995.25 | 0 |
| 995.3 | 0 |
| 995.35 | 0 |
| 995.4 | 0 |
| 995.45 | 0 |
| 995.5 | 0 |
| 995.55 | 0 |
| 995.6 | 0 |
| 995.65 | 0 |
| 995.7 | 0 |
| 995.75 | 0 |
| 995.8 | 0 |
| 995.85 | 0 |
| 995.9 | 0 |
| 995.95 | 0 |
| 996.0 | 0 |
| 996.05 | 0 |
| 996.1 | 0 |
| 996.15 | 0 |
| 996.2 | 0 |
| 996.25 | 0 |
| 996.3 | 0 |
| 996.35 | 0 |
| 996.4 | 0 |
| 996.45 | 0 |
| 996.5 | 0 |
| 996.55 | 0 |
| 996.6 | 0 |
| 996.65 | 0 |
| 996.7 | 0 |
| 996.75 | 0 |
| 996.8 | 0 |
| 996.85 | 0 |
| 996.9 | 0 |
| 996.95 | 0 |
| 997.0 | 0 |
| 997.05 | 0 |
| 997.1 | 0 |
| 997.15 | 0 |
| 997.2 | 0 |
| 997.25 | 0 |
| 997.3 | 0 |
| 997.35 | 0 |
| 997.4 | 0 |
| 997.45 | 0 |
| 997.5 | 0 |
| 997.55 | 0 |
| 997.6 | 0 |
| 997.65 | 0 |
| 997.7 | 0 |
| 997.75 | 0 |
| 997.8 | 0 |
| 997.85 | 0 |
| 997.9 | 0 |
| 997.95 | 0 |
| 998.0 | 0 |
| 998.05 | 0 |
| 998.1 | 0 |
| 998.15 | 0 |
| 998.2 | 0 |
| 998.25 | 0 |
| 998.3 | 0 |
| 998.35 | 0 |
| 998.4 | 0 |
| 998.45 | 0 |
| 998.5 | 0 |
| 998.55 | 0 |
| 998.6 | 0 |
| 998.65 | 0 |
| 998.7 | 0 |
| 998.75 | 0 |
| 998.8 | 0 |
| 998.85 | 0 |
| 998.9 | 0 |
| 998.95 | 0 |
| 999.0 | 0 |
| 999.05 | 0 |
| 999.1 | 0 |
| 999.15 | 0 |
| 999.2 | 0 |
| 999.25 | 0 |
| 999.3 | 0 |
| 999.35 | 0 |
| 999.4 | 0 |
| 999.45 | 0 |
| 999.5 | 0 |
| 999.55 | 0 |
| 999.6 | 0 |
| 999.65 | 0 |
| 999.7 | 0 |
| 999.75 | 0 |
| 999.8 | 0 |
| 999.85 | 0 |
| 999.9 | 0 |
| 999.95 | 0 |
| 1000.0 | 0 |
| 1000.05 | 0 |
| 1000.1 | 0 |
| 1000.15 | 0 |
| 1000.2 | 0 |
| 1000.25 | 0 |
| 1000.3 | 0 |
| 1000.35 | 0 |
| 1000.4 | 0 |
| 1000.45 | 0 |
| 1000.5 | 0 |
| 1000.55 | 0 |
| 1000.6 | 0 |
| 1000.65 | 0 |
| 1000.7 | 0 |
| 1000.75 | 0 |
| 1000.8 | 0 |
| 1000.85 | 0 |
| 1000.9 | 0 |
| 1000.95 | 0 |
| 1001.0 | 0 |
| 1001.05 | 0 |
| 1001.1 | 0 |
| 1001.15 | 0 |
| 1001.2 | 0 |
| 1001.25 | 0 |
| 1001.3 | 0 |
| 1001.35 | 0 |
| 1001.4 | 0 |
| 1001.45 | 0 |
| 1001.5 | 0 |
| 1001.55 | 0 |
| 1001.6 | 0 |
| 1001.65 | 0 |
| 1001.7 | 0 |
| 1001.75 | 0 |
| 1001.8 | 0 |
| 1001.85 | 0 |
| 1001.9 | 0 |
| 1001.95 | 0 |
| 1002.0 | 0 |
| 1002.05 | 0 |
| 1002.1 | 0 |
| 1002.15 | 0 |
| 1002.2 | 0 |
| 1002.25 | 0 |
| 1002.3 | 0 |
| 1002.35 | 0 |
| 1002.4 | 0 |
| 1002.45 | 0 |
| 1002.5 | 0 |
| 1002.55 | 0 |
| 1002.6 | 0 |
| 1002.65 | 0 |
| 1002.7 | 0 |
| 1002.75 | 0 |
| 1002.8 | 0 |
| 1002.85 | 0 |
| 1002.9 | 0 |
| 1002.95 | 0 |
| 1003.0 | 0 |
| 1003.05 | 0 |
| 1003.1 | 0 |
| 1003.15 | 0 |
| 1003.2 | 0 |
| 1003.25 | 0 |
| 1003.3 | 0 |
| 1003.35 | 0 |
| 1003.4 | 0 |
| 1003.45 | 0 |
| 1003.5 | 0 |
| 1003.55 | 0 |
| 1003.6 | 0 |
| 1003.65 | 0 |
| 1003.7 | 0 |
| 1003.75 | 0 |
| 1003.8 | 0 |
| 1003.85 | 0 |
| 1003.9 | 0 |
| 1003.95 | -0.001 |
| 1004.0 | -0.001 |
| 1004.05 | -0.001 |
| 1004.1 | -0.001 |
| 1004.15 | -0.001 |
| 1004.2 | 0 |
| 1004.25 | 0 |
| 1004.3 | 0 |
| 1004.35 | 0 |
| 1004.4 | 0 |
| 1004.45 | 0 |
| 1004.5 | 0 |
| 1004.55 | 0 |
| 1004.6 | 0 |
| 1004.65 | 0 |
| 1004.7 | 0 |
| 1004.75 | 0 |
| 1004.8 | 0 |
| 1004.85 | 0 |
| 1004.9 | 0 |
| 1004.95 | 0 |
| 1005.0 | 0 |
| 1005.05 | 0 |
| 1005.1 | 0 |
| 1005.15 | 0 |
| 1005.2 | 0 |
| 1005.25 | 0 |
| 1005.3 | 0 |
| 1005.35 | 0 |
| 1005.4 | 0 |
| 1005.45 | 0 |
| 1005.5 | 0 |
| 1005.55 | 0 |
| 1005.6 | 0 |
| 1005.65 | 0 |
| 1005.7 | 0 |
| 1005.75 | 0 |
| 1005.8 | 0 |
| 1005.85 | 0 |
| 1005.9 | 0 |
| 1005.95 | 0 |
| 1006.0 | 0 |
| 1006.05 | 0 |
| 1006.1 | 0 |
| 1006.15 | 0 |
| 1006.2 | 0 |
| 1006.25 | 0 |
| 1006.3 | 0 |
| 1006.35 | 0 |
| 1006.4 | 0 |
| 1006.45 | 0 |
| 1006.5 | 0 |
| 1006.55 | 0 |
| 1006.6 | 0 |
| 1006.65 | 0 |
| 1006.7 | 0 |
| 1006.75 | 0 |
| 1006.8 | 0 |
| 1006.85 | 0 |
| 1006.9 | 0 |
| 1006.95 | 0 |
| 1007.0 | 0 |
| 1007.05 | 0 |
| 1007.1 | 0 |
| 1007.15 | 0 |
| 1007.2 | 0 |
| 1007.25 | 0 |
| 1007.3 | 0 |
| 1007.35 | 0 |
| 1007.4 | 0 |
| 1007.45 | 0 |
| 1007.5 | 0 |
| 1007.55 | 0 |
| 1007.6 | 0 |
| 1007.65 | 0 |
| 1007.7 | 0 |
| 1007.75 | 0 |
| 1007.8 | 0 |
| 1007.85 | 0 |
| 1007.9 | 0 |
| 1007.95 | 0 |
| 1008.0 | 0 |
| 1008.05 | 0 |
| 1008.1 | 0 |
| 1008.15 | 0 |
| 1008.2 | 0 |
| 1008.25 | 0 |
| 1008.3 | 0 |
| 1008.35 | 0 |
| 1008.4 | 0 |
| 1008.45 | 0 |
| 1008.5 | 0 |
| 1008.55 | 0 |
| 1008.6 | 0 |
| 1008.65 | 0 |
| 1008.7 | 0 |
| 1008.75 | 0 |
| 1008.8 | 0 |
| 1008.85 | 0 |
| 1008.9 | 0 |
| 1008.95 | 0 |
| 1009.0 | 0 |
| 1009.05 | 0 |
| 1009.1 | 0 |
| 1009.15 | 0 |
| 1009.2 | 0 |
| 1009.25 | 0 |
| 1009.3 | 0 |
| 1009.35 | 0 |
| 1009.4 | 0 |
| 1009.45 | 0 |
| 1009.5 | 0 |
| 1009.55 | 0 |
| 1009.6 | 0 |
| 1009.65 | 0 |
| 1009.7 | 0 |
| 1009.75 | 0 |
| 1009.8 | -0.001 |
| 1009.85 | 0 |
| 1009.9 | -0.001 |
| 1009.95 | -0.001 |
| 1010.0 | -0.001 |
| 1010.05 | -0.001 |
| 1010.1 | -0.001 |
| 1010.15 | -0.001 |
| 1010.2 | -0.001 |
| 1010.25 | -0.001 |
| 1010.3 | -0.001 |
| 1010.35 | -0.001 |
| 1010.4 | -0.001 |
| 1010.45 | -0.001 |
| 1010.5 | -0.001 |
| 1010.55 | -0.001 |
| 1010.6 | -0.001 |
| 1010.65 | -0.001 |
| 1010.7 | -0.001 |
| 1010.75 | -0.001 |
| 1010.8 | -0.001 |
| 1010.85 | -0.001 |
| 1010.9 | -0.001 |
| 1010.95 | -0.001 |
| 1011.0 | -0.001 |
| 1011.05 | -0.001 |
| 1011.1 | -0.001 |
| 1011.15 | -0.001 |
| 1011.2 | -0.001 |
| 1011.25 | -0.001 |
| 1011.3 | -0.001 |
| 1011.35 | -0.001 |
| 1011.4 | -0.001 |
| 1011.45 | -0.001 |
| 1011.5 | -0.001 |
| 1011.55 | -0.001 |
| 1011.6 | -0.001 |
| 1011.65 | -0.001 |
| 1011.7 | -0.001 |
| 1011.75 | -0.001 |
| 1011.8 | -0.001 |
| 1011.85 | -0.001 |
| 1011.9 | -0.001 |
| 1011.95 | -0.001 |
| 1012.0 | -0.001 |
| 1012.05 | 0 |
| 1012.1 | 0 |
| 1012.15 | 0 |
| 1012.2 | -0.001 |
| 1012.25 | -0.001 |
| 1012.3 | -0.001 |
| 1012.35 | -0.001 |
| 1012.4 | -0.001 |
| 1012.45 | -0.001 |
| 1012.5 | -0.001 |
| 1012.55 | -0.001 |
| 1012.6 | -0.001 |
| 1012.65 | -0.001 |
| 1012.7 | -0.001 |
| 1012.75 | -0.001 |
| 1012.8 | -0.001 |
| 1012.85 | -0.001 |
| 1012.9 | -0.001 |
| 1012.95 | -0.001 |
| 1013.0 | -0.001 |
| 1013.05 | -0.001 |
| 1013.1 | -0.001 |
| 1013.15 | -0.001 |
| 1013.2 | -0.001 |
| 1013.25 | -0.001 |
| 1013.3 | -0.001 |
| 1013.35 | -0.001 |
| 1013.4 | -0.001 |
| 1013.45 | 0 |
| 1013.5 | 0 |
| 1013.55 | -0.001 |
| 1013.6 | 0 |
| 1013.65 | 0 |
| 1013.7 | 0 |
| 1013.75 | -0.001 |
| 1013.8 | -0.001 |
| 1013.85 | -0.001 |
| 1013.9 | -0.001 |
| 1013.95 | -0.001 |
| 1014.0 | -0.001 |
| 1014.05 | -0.001 |
| 1014.1 | -0.001 |
| 1014.15 | -0.001 |
| 1014.2 | -0.001 |
| 1014.25 | -0.001 |
| 1014.3 | -0.001 |
| 1014.35 | -0.001 |
| 1014.4 | -0.001 |
| 1014.45 | -0.001 |
| 1014.5 | -0.001 |
| 1014.55 | -0.001 |
| 1014.6 | -0.001 |
| 1014.65 | -0.001 |
| 1014.7 | -0.001 |
| 1014.75 | -0.001 |
| 1014.8 | -0.001 |
| 1014.85 | -0.001 |
| 1014.9 | -0.001 |
| 1014.95 | -0.001 |
| 1015.0 | -0.001 |
| 1015.05 | -0.001 |
| 1015.1 | -0.001 |
| 1015.15 | -0.001 |
| 1015.2 | -0.001 |
| 1015.25 | -0.001 |
| 1015.3 | -0.001 |
| 1015.35 | -0.001 |
| 1015.4 | -0.001 |
| 1015.45 | -0.001 |
| 1015.5 | -0.001 |
| 1015.55 | -0.001 |
| 1015.6 | -0.001 |
| 1015.65 | -0.001 |
| 1015.7 | -0.001 |
| 1015.75 | -0.001 |
| 1015.8 | -0.001 |
| 1015.85 | -0.001 |
| 1015.9 | -0.001 |
| 1015.95 | -0.001 |
| 1016.0 | -0.001 |
| 1016.05 | -0.001 |
| 1016.1 | -0.001 |
| 1016.15 | -0.001 |
| 1016.2 | -0.001 |
| 1016.25 | -0.001 |
| 1016.3 | -0.001 |
| 1016.35 | -0.001 |
| 1016.4 | -0.001 |
| 1016.45 | -0.001 |
| 1016.5 | -0.001 |
| 1016.55 | -0.001 |
| 1016.6 | -0.001 |
| 1016.65 | -0.001 |
| 1016.7 | -0.001 |
| 1016.75 | -0.001 |
| 1016.8 | -0.001 |
| 1016.85 | -0.001 |
| 1016.9 | -0.001 |
| 1016.95 | -0.001 |
| 1017.0 | -0.001 |
| 1017.05 | -0.001 |
| 1017.1 | -0.001 |
| 1017.15 | -0.001 |
| 1017.2 | -0.001 |
| 1017.25 | -0.001 |
| 1017.3 | -0.001 |
| 1017.35 | -0.001 |
| 1017.4 | -0.001 |
| 1017.45 | -0.001 |
| 1017.5 | -0.001 |
| 1017.55 | -0.001 |
| 1017.6 | -0.001 |
| 1017.65 | -0.001 |
| 1017.7 | -0.001 |
| 1017.75 | -0.001 |
| 1017.8 | -0.001 |
| 1017.85 | -0.001 |
| 1017.9 | -0.001 |
| 1017.95 | -0.001 |
| 1018.0 | -0.001 |
| 1018.05 | -0.001 |
| 1018.1 | -0.001 |
| 1018.15 | -0.001 |
| 1018.2 | -0.001 |
| 1018.25 | -0.001 |
| 1018.3 | -0.001 |
| 1018.35 | -0.001 |
| 1018.4 | -0.001 |
| 1018.45 | -0.001 |
| 1018.5 | -0.001 |
| 1018.55 | -0.001 |
| 1018.6 | -0.001 |
| 1018.65 | -0.001 |
| 1018.7 | -0.001 |
| 1018.75 | -0.001 |
| 1018.8 | -0.001 |
| 1018.85 | -0.001 |
| 1018.9 | -0.001 |
| 1018.95 | -0.001 |
| 1019.0 | -0.001 |
| 1019.05 | -0.001 |
| 1019.1 | -0.001 |
| 1019.15 | -0.001 |
| 1019.2 | -0.001 |
| 1019.25 | -0.001 |
| 1019.3 | -0.001 |
| 1019.35 | -0.001 |
| 1019.4 | -0.001 |
| 1019.45 | 0 |
| 1019.5 | -0.001 |
| 1019.55 | -0.001 |
| 1019.6 | -0.001 |
| 1019.65 | -0.001 |
| 1019.7 | -0.001 |
| 1019.75 | -0.001 |
| 1019.8 | -0.001 |
| 1019.85 | -0.001 |
| 1019.9 | -0.001 |
| 1019.95 | -0.001 |
| 1020.0 | -0.001 |
| 1020.05 | 0 |
| 1020.1 | 0 |
| 1020.15 | 0 |
| 1020.2 | 0 |
| 1020.25 | -0.001 |
| 1020.3 | -0.001 |
| 1020.35 | -0.001 |
| 1020.4 | -0.001 |
| 1020.45 | -0.001 |
| 1020.5 | -0.001 |
| 1020.55 | -0.001 |
| 1020.6 | -0.001 |
| 1020.65 | -0.001 |
| 1020.7 | -0.001 |
| 1020.75 | 0 |
| 1020.8 | 0 |
| 1020.85 | 0 |
| 1020.9 | 0 |
| 1020.95 | -0.001 |
| 1021.0 | -0.001 |
| 1021.05 | -0.001 |
| 1021.1 | -0.001 |
| 1021.15 | -0.001 |
| 1021.2 | -0.001 |
| 1021.25 | -0.001 |
| 1021.3 | -0.001 |
| 1021.35 | -0.001 |
| 1021.4 | -0.001 |
| 1021.45 | -0.001 |
| 1021.5 | -0.001 |
| 1021.55 | -0.001 |
| 1021.6 | -0.001 |
| 1021.65 | 0 |
| 1021.7 | 0 |
| 1021.75 | 0 |
| 1021.8 | 0 |
| 1021.85 | 0 |
| 1021.9 | -0.001 |
| 1021.95 | -0.001 |
| 1022.0 | -0.001 |
| 1022.05 | -0.001 |
| 1022.1 | -0.001 |
| 1022.15 | -0.001 |
| 1022.2 | -0.001 |
| 1022.25 | -0.001 |
| 1022.3 | -0.001 |
| 1022.35 | -0.001 |
| 1022.4 | -0.001 |
| 1022.45 | -0.001 |
| 1022.5 | -0.001 |
| 1022.55 | -0.001 |
| 1022.6 | -0.001 |
| 1022.65 | -0.001 |
| 1022.7 | -0.001 |
| 1022.75 | 0 |
| 1022.8 | 0 |
| 1022.85 | 0 |
| 1022.9 | -0.001 |
| 1022.95 | -0.001 |
| 1023.0 | -0.001 |
| 1023.05 | -0.001 |
| 1023.1 | -0.001 |
| 1023.15 | 0 |
| 1023.2 | 0 |
| 1023.25 | 0 |
| 1023.3 | 0 |
| 1023.35 | 0 |
| 1023.4 | 0 |
| 1023.45 | 0 |
| 1023.5 | 0 |
| 1023.55 | 0 |
| 1023.6 | 0 |
| 1023.65 | 0 |
| 1023.7 | 0 |
| 1023.75 | 0 |
| 1023.8 | 0 |
| 1023.85 | 0 |
| 1023.9 | 0 |
| 1023.95 | 0 |
| 1024.0 | 0 |
| 1024.05 | 0 |
| 1024.1 | 0 |
| 1024.15 | 0 |
| 1024.2 | 0 |
| 1024.25 | 0 |
| 1024.3 | 0 |
| 1024.35 | 0 |
| 1024.4 | 0 |
| 1024.45 | 0 |
| 1024.5 | 0 |
| 1024.55 | 0 |
| 1024.6 | 0 |
| 1024.65 | 0 |
| 1024.7 | 0 |
| 1024.75 | 0 |
| 1024.8 | 0 |
| 1024.85 | 0 |
| 1024.9 | 0 |
| 1024.95 | 0 |
| 1025.0 | 0 |
| 1025.05 | 0 |
| 1025.1 | 0 |
| 1025.15 | 0 |
| 1025.2 | 0 |
| 1025.25 | 0 |
| 1025.3 | 0 |
| 1025.35 | 0 |
| 1025.4 | 0 |
| 1025.45 | 0 |
| 1025.5 | 0 |
| 1025.55 | 0 |
| 1025.6 | 0 |
| 1025.65 | 0 |
| 1025.7 | 0 |
| 1025.75 | 0 |
| 1025.8 | 0 |
| 1025.85 | 0 |
| 1025.9 | -0.001 |
| 1025.95 | -0.001 |
| 1026.0 | -0.001 |
| 1026.05 | -0.001 |
| 1026.1 | -0.001 |
| 1026.15 | 0 |
| 1026.2 | 0 |
| 1026.25 | 0 |
| 1026.3 | 0 |
| 1026.35 | 0 |
| 1026.4 | 0 |
| 1026.45 | 0 |
| 1026.5 | 0 |
| 1026.55 | 0 |
| 1026.6 | 0 |
| 1026.65 | 0 |
| 1026.7 | 0 |
| 1026.75 | 0 |
| 1026.8 | 0 |
| 1026.85 | 0 |
| 1026.9 | 0 |
| 1026.95 | 0 |
| 1027.0 | 0 |
| 1027.05 | 0 |
| 1027.1 | 0 |
| 1027.15 | 0 |
| 1027.2 | 0 |
| 1027.25 | 0 |
| 1027.3 | 0 |
| 1027.35 | 0 |
| 1027.4 | 0 |
| 1027.45 | 0 |
| 1027.5 | 0 |
| 1027.55 | 0 |
| 1027.6 | 0 |
| 1027.65 | 0 |
| 1027.7 | 0 |
| 1027.75 | 0 |
| 1027.8 | 0 |
| 1027.85 | 0 |
| 1027.9 | 0 |
| 1027.95 | 0 |
| 1028.0 | 0 |
| 1028.05 | 0 |
| 1028.1 | 0 |
| 1028.15 | 0 |
| 1028.2 | 0 |
| 1028.25 | 0 |
| 1028.3 | 0 |
| 1028.35 | 0 |
| 1028.4 | 0 |
| 1028.45 | 0 |
| 1028.5 | 0 |
| 1028.55 | 0 |
| 1028.6 | 0 |
| 1028.65 | 0 |
| 1028.7 | 0 |
| 1028.75 | 0 |
| 1028.8 | 0 |
| 1028.85 | 0 |
| 1028.9 | 0 |
| 1028.95 | 0 |
| 1029.0 | 0 |
| 1029.05 | 0 |
| 1029.1 | 0 |
| 1029.15 | 0 |
| 1029.2 | 0 |
| 1029.25 | 0 |
| 1029.3 | 0 |
| 1029.35 | 0 |
| 1029.4 | 0 |
| 1029.45 | 0 |
| 1029.5 | 0 |
| 1029.55 | 0 |
| 1029.6 | 0 |
| 1029.65 | 0 |
| 1029.7 | 0 |
| 1029.75 | 0 |
| 1029.8 | 0 |
| 1029.85 | 0 |
| 1029.9 | 0 |
| 1029.95 | 0 |
| 1030.0 | 0 |
| 1030.05 | 0 |
| 1030.1 | 0 |
| 1030.15 | 0 |
| 1030.2 | 0 |
| 1030.25 | 0 |
| 1030.3 | 0 |
| 1030.35 | 0 |
| 1030.4 | 0 |
| 1030.45 | 0 |
| 1030.5 | 0 |
| 1030.55 | 0 |
| 1030.6 | 0 |
| 1030.65 | 0 |
| 1030.7 | 0 |
| 1030.75 | 0 |
| 1030.8 | 0 |
| 1030.85 | 0 |
| 1030.9 | 0 |
| 1030.95 | 0 |
| 1031.0 | 0 |
| 1031.05 | 0 |
| 1031.1 | 0 |
| 1031.15 | 0 |
| 1031.2 | 0 |
| 1031.25 | 0 |
| 1031.3 | 0 |
| 1031.35 | 0 |
| 1031.4 | 0 |
| 1031.45 | 0 |
| 1031.5 | 0 |
| 1031.55 | 0 |
| 1031.6 | 0 |
| 1031.65 | 0 |
| 1031.7 | 0 |
| 1031.75 | 0 |
| 1031.8 | 0 |
| 1031.85 | 0 |
| 1031.9 | 0 |
| 1031.95 | 0 |
| 1032.0 | 0 |
| 1032.05 | 0 |
| 1032.1 | 0 |
| 1032.15 | 0 |
| 1032.2 | 0 |
| 1032.25 | 0 |
| 1032.3 | 0 |
| 1032.35 | 0 |
| 1032.4 | 0 |
| 1032.45 | 0 |
| 1032.5 | 0 |
| 1032.55 | 0 |
| 1032.6 | 0 |
| 1032.65 | 0 |
| 1032.7 | 0 |
| 1032.75 | 0 |
| 1032.8 | 0 |
| 1032.85 | 0 |
| 1032.9 | 0 |
| 1032.95 | 0 |
| 1033.0 | 0 |
| 1033.05 | 0 |
| 1033.1 | 0 |
| 1033.15 | 0 |
| 1033.2 | 0 |
| 1033.25 | 0 |
| 1033.3 | 0 |
| 1033.35 | 0 |
| 1033.4 | 0 |
| 1033.45 | 0 |
| 1033.5 | 0 |
| 1033.55 | 0 |
| 1033.6 | 0 |
| 1033.65 | 0 |
| 1033.7 | 0 |
| 1033.75 | 0 |
| 1033.8 | 0 |
| 1033.85 | 0 |
| 1033.9 | 0 |
| 1033.95 | 0 |
| 1034.0 | 0 |
| 1034.05 | 0 |
| 1034.1 | 0 |
| 1034.15 | 0 |
| 1034.2 | 0 |
| 1034.25 | 0 |
| 1034.3 | 0 |
| 1034.35 | 0 |
| 1034.4 | 0 |
| 1034.45 | 0 |
| 1034.5 | 0 |
| 1034.55 | 0 |
| 1034.6 | 0 |
| 1034.65 | 0 |
| 1034.7 | 0 |
| 1034.75 | 0 |
| 1034.8 | 0 |
| 1034.85 | 0 |
| 1034.9 | 0 |
| 1034.95 | 0 |
| 1035.0 | 0 |
| 1035.05 | 0 |
| 1035.1 | 0 |
| 1035.15 | 0 |
| 1035.2 | 0 |
| 1035.25 | 0 |
| 1035.3 | 0 |
| 1035.35 | 0 |
| 1035.4 | 0 |
| 1035.45 | 0 |
| 1035.5 | 0 |
| 1035.55 | 0 |
| 1035.6 | 0 |
| 1035.65 | 0 |
| 1035.7 | 0 |
| 1035.75 | 0 |
| 1035.8 | 0 |
| 1035.85 | 0 |
| 1035.9 | 0 |
| 1035.95 | 0 |
| 1036.0 | 0 |
| 1036.05 | 0 |
| 1036.1 | 0 |
| 1036.15 | 0 |
| 1036.2 | 0 |
| 1036.25 | 0 |
| 1036.3 | 0 |
| 1036.35 | 0 |
| 1036.4 | 0 |
| 1036.45 | 0 |
| 1036.5 | 0 |
| 1036.55 | 0 |
| 1036.6 | 0 |
| 1036.65 | 0 |
| 1036.7 | 0 |
| 1036.75 | 0 |
| 1036.8 | 0 |
| 1036.85 | 0 |
| 1036.9 | 0 |
| 1036.95 | 0 |
| 1037.0 | 0 |
| 1037.05 | 0 |
| 1037.1 | 0 |
| 1037.15 | 0 |
| 1037.2 | 0 |
| 1037.25 | 0 |
| 1037.3 | 0 |
| 1037.35 | 0 |
| 1037.4 | 0 |
| 1037.45 | 0 |
| 1037.5 | 0 |
| 1037.55 | 0 |
| 1037.6 | 0 |
| 1037.65 | 0 |
| 1037.7 | 0 |
| 1037.75 | 0 |
| 1037.8 | 0 |
| 1037.85 | 0 |
| 1037.9 | 0 |
| 1037.95 | 0 |
| 1038.0 | 0 |
| 1038.05 | 0 |
| 1038.1 | 0 |
| 1038.15 | 0 |
| 1038.2 | 0 |
| 1038.25 | 0 |
| 1038.3 | 0 |
| 1038.35 | 0 |
| 1038.4 | 0 |
| 1038.45 | 0 |
| 1038.5 | 0 |
| 1038.55 | 0 |
| 1038.6 | 0 |
| 1038.65 | 0 |
| 1038.7 | 0 |
| 1038.75 | 0 |
| 1038.8 | 0 |
| 1038.85 | 0 |
| 1038.9 | 0 |
| 1038.95 | 0 |
| 1039.0 | 0 |
| 1039.05 | 0 |
| 1039.1 | 0 |
| 1039.15 | 0 |
| 1039.2 | 0 |
| 1039.25 | 0 |
| 1039.3 | 0 |
| 1039.35 | 0 |
| 1039.4 | 0 |
| 1039.45 | 0 |
| 1039.5 | 0 |
| 1039.55 | 0 |
| 1039.6 | 0 |
| 1039.65 | 0 |
| 1039.7 | 0 |
| 1039.75 | 0 |
| 1039.8 | 0 |
| 1039.85 | 0 |
| 1039.9 | 0 |
| 1039.95 | 0 |
| 1040.0 | 0 |
| 1040.05 | 0 |
| 1040.1 | 0 |
| 1040.15 | 0 |
| 1040.2 | 0 |
| 1040.25 | 0 |
| 1040.3 | 0 |
| 1040.35 | 0 |
| 1040.4 | 0 |
| 1040.45 | 0 |
| 1040.5 | 0 |
| 1040.55 | 0 |
| 1040.6 | 0 |
| 1040.65 | 0 |
| 1040.7 | 0 |
| 1040.75 | 0 |
| 1040.8 | 0 |
| 1040.85 | 0 |
| 1040.9 | 0 |
| 1040.95 | 0 |
| 1041.0 | 0 |
| 1041.05 | 0 |
| 1041.1 | 0 |
| 1041.15 | 0 |
| 1041.2 | 0 |
| 1041.25 | 0 |
| 1041.3 | 0 |
| 1041.35 | 0 |
| 1041.4 | 0 |
| 1041.45 | 0 |
| 1041.5 | 0 |
| 1041.55 | 0 |
| 1041.6 | 0 |
| 1041.65 | 0 |
| 1041.7 | 0 |
| 1041.75 | 0 |
| 1041.8 | 0 |
| 1041.85 | 0 |
| 1041.9 | 0 |
| 1041.95 | 0 |
| 1042.0 | 0 |
| 1042.05 | 0 |
| 1042.1 | 0 |
| 1042.15 | 0 |
| 1042.2 | 0 |
| 1042.25 | 0 |
| 1042.3 | 0 |
| 1042.35 | 0 |
| 1042.4 | 0 |
| 1042.45 | 0 |
| 1042.5 | 0 |
| 1042.55 | 0 |
| 1042.6 | 0 |
| 1042.65 | 0 |
| 1042.7 | 0 |
| 1042.75 | 0 |
| 1042.8 | 0 |
| 1042.85 | 0 |
| 1042.9 | 0 |
| 1042.95 | 0 |
| 1043.0 | 0 |
| 1043.05 | 0 |
| 1043.1 | 0 |
| 1043.15 | 0 |
| 1043.2 | 0 |
| 1043.25 | 0 |
| 1043.3 | 0 |
| 1043.35 | 0 |
| 1043.4 | 0 |
| 1043.45 | 0 |
| 1043.5 | 0 |
| 1043.55 | 0 |
| 1043.6 | 0 |
| 1043.65 | 0 |
| 1043.7 | 0 |
| 1043.75 | 0 |
| 1043.8 | 0 |
| 1043.85 | 0 |
| 1043.9 | 0 |
| 1043.95 | 0 |
| 1044.0 | 0 |
| 1044.05 | 0 |
| 1044.1 | 0 |
| 1044.15 | 0 |
| 1044.2 | 0 |
| 1044.25 | 0 |
| 1044.3 | 0 |
| 1044.35 | 0 |
| 1044.4 | 0 |
| 1044.45 | 0 |
| 1044.5 | 0 |
| 1044.55 | 0 |
| 1044.6 | 0 |
| 1044.65 | 0 |
| 1044.7 | 0 |
| 1044.75 | 0 |
| 1044.8 | 0 |
| 1044.85 | 0 |
| 1044.9 | 0 |
| 1044.95 | 0 |
| 1045.0 | 0 |
| 1045.05 | 0 |
| 1045.1 | 0 |
| 1045.15 | 0 |
| 1045.2 | 0 |
| 1045.25 | 0 |
| 1045.3 | 0 |
| 1045.35 | 0 |
| 1045.4 | 0 |
| 1045.45 | 0 |
| 1045.5 | 0 |
| 1045.55 | 0 |
| 1045.6 | 0 |
| 1045.65 | 0 |
| 1045.7 | 0 |
| 1045.75 | 0 |
| 1045.8 | 0 |
| 1045.85 | 0 |
| 1045.9 | 0 |
| 1045.95 | 0 |
| 1046.0 | 0 |
| 1046.05 | 0 |
| 1046.1 | 0 |
| 1046.15 | 0 |
| 1046.2 | 0 |
| 1046.25 | 0 |
| 1046.3 | 0 |
| 1046.35 | 0 |
| 1046.4 | 0 |
| 1046.45 | 0 |
| 1046.5 | 0 |
| 1046.55 | 0 |
| 1046.6 | 0 |
| 1046.65 | 0 |
| 1046.7 | 0 |
| 1046.75 | 0 |
| 1046.8 | 0 |
| 1046.85 | 0 |
| 1046.9 | 0 |
| 1046.95 | 0 |
| 1047.0 | 0 |
| 1047.05 | 0 |
| 1047.1 | 0 |
| 1047.15 | 0 |
| 1047.2 | 0 |
| 1047.25 | 0 |
| 1047.3 | 0 |
| 1047.35 | 0 |
| 1047.4 | 0 |
| 1047.45 | 0 |
| 1047.5 | 0 |
| 1047.55 | 0 |
| 1047.6 | 0 |
| 1047.65 | 0 |
| 1047.7 | 0 |
| 1047.75 | 0 |
| 1047.8 | 0 |
| 1047.85 | 0 |
| 1047.9 | 0 |
| 1047.95 | 0 |
| 1048.0 | 0 |
| 1048.05 | 0 |
| 1048.1 | 0 |
| 1048.15 | 0 |
| 1048.2 | 0 |
| 1048.25 | 0 |
| 1048.3 | 0 |
| 1048.35 | 0 |
| 1048.4 | 0 |
| 1048.45 | 0 |
| 1048.5 | 0 |
| 1048.55 | 0 |
| 1048.6 | 0 |
| 1048.65 | 0 |
| 1048.7 | 0 |
| 1048.75 | 0 |
| 1048.8 | 0 |
| 1048.85 | 0 |
| 1048.9 | 0 |
| 1048.95 | 0 |
| 1049.0 | 0 |
| 1049.05 | 0 |
| 1049.1 | 0 |
| 1049.15 | 0 |
| 1049.2 | 0 |
| 1049.25 | 0 |
| 1049.3 | 0 |
| 1049.35 | 0 |
| 1049.4 | 0 |
| 1049.45 | 0 |
| 1049.5 | 0 |
| 1049.55 | 0 |
| 1049.6 | 0 |
| 1049.65 | 0 |
| 1049.7 | 0 |
| 1049.75 | 0 |
| 1049.8 | 0 |
| 1049.85 | 0 |
| 1049.9 | 0 |
| 1049.95 | 0 |
| 1050.0 | 0 |
| 1050.05 | 0 |
| 1050.1 | 0 |
| 1050.15 | 0 |
| 1050.2 | 0 |
| 1050.25 | 0 |
| 1050.3 | 0 |
| 1050.35 | 0 |
| 1050.4 | 0 |
| 1050.45 | 0 |
| 1050.5 | 0 |
| 1050.55 | 0 |
| 1050.6 | 0 |
| 1050.65 | 0 |
| 1050.7 | 0 |
| 1050.75 | 0 |
| 1050.8 | 0 |
| 1050.85 | 0 |
| 1050.9 | 0 |
| 1050.95 | 0 |
| 1051.0 | 0 |
| 1051.05 | 0 |
| 1051.1 | 0 |
| 1051.15 | 0 |
| 1051.2 | 0 |
| 1051.25 | 0 |
| 1051.3 | 0 |
| 1051.35 | 0 |
| 1051.4 | 0 |
| 1051.45 | 0 |
| 1051.5 | 0 |
| 1051.55 | 0 |
| 1051.6 | 0 |
| 1051.65 | 0 |
| 1051.7 | 0 |
| 1051.75 | 0 |
| 1051.8 | 0 |
| 1051.85 | 0 |
| 1051.9 | 0 |
| 1051.95 | 0 |
| 1052.0 | 0 |
| 1052.05 | 0 |
| 1052.1 | 0 |
| 1052.15 | 0 |
| 1052.2 | 0 |
| 1052.25 | 0 |
| 1052.3 | 0 |
| 1052.35 | 0 |
| 1052.4 | 0 |
| 1052.45 | 0 |
| 1052.5 | 0 |
| 1052.55 | 0 |
| 1052.6 | 0 |
| 1052.65 | 0 |
| 1052.7 | 0 |
| 1052.75 | 0 |
| 1052.8 | 0 |
| 1052.85 | 0 |
| 1052.9 | 0 |
| 1052.95 | 0 |
| 1053.0 | 0 |
| 1053.05 | 0 |
| 1053.1 | 0 |
| 1053.15 | 0 |
| 1053.2 | 0 |
| 1053.25 | 0 |
| 1053.3 | 0 |
| 1053.35 | 0 |
| 1053.4 | 0 |
| 1053.45 | 0 |
| 1053.5 | 0 |
| 1053.55 | 0 |
| 1053.6 | 0 |
| 1053.65 | 0 |
| 1053.7 | 0 |
| 1053.75 | 0 |
| 1053.8 | 0 |
| 1053.85 | 0 |
| 1053.9 | 0 |
| 1053.95 | 0 |
| 1054.0 | 0 |
| 1054.05 | 0 |
| 1054.1 | 0 |
| 1054.15 | 0 |
| 1054.2 | 0 |
| 1054.25 | 0 |
| 1054.3 | 0 |
| 1054.35 | 0 |
| 1054.4 | 0 |
| 1054.45 | 0 |
| 1054.5 | 0 |
| 1054.55 | 0 |
| 1054.6 | 0 |
| 1054.65 | 0 |
| 1054.7 | 0 |
| 1054.75 | 0 |
| 1054.8 | 0 |
| 1054.85 | 0 |
| 1054.9 | 0 |
| 1054.95 | 0 |
| 1055.0 | 0 |
| 1055.05 | 0 |
| 1055.1 | 0 |
| 1055.15 | 0 |
| 1055.2 | 0 |
| 1055.25 | 0 |
| 1055.3 | 0 |
| 1055.35 | 0 |
| 1055.4 | 0 |
| 1055.45 | 0 |
| 1055.5 | 0 |
| 1055.55 | 0 |
| 1055.6 | 0 |
| 1055.65 | 0 |
| 1055.7 | 0 |
| 1055.75 | 0 |
| 1055.8 | 0 |
| 1055.85 | 0 |
| 1055.9 | 0 |
| 1055.95 | 0 |
| 1056.0 | 0 |
| 1056.05 | 0 |
| 1056.1 | 0 |
| 1056.15 | 0 |
| 1056.2 | 0 |
| 1056.25 | 0 |
| 1056.3 | 0 |
| 1056.35 | 0 |
| 1056.4 | 0 |
| 1056.45 | 0 |
| 1056.5 | 0 |
| 1056.55 | 0 |
| 1056.6 | 0 |
| 1056.65 | 0 |
| 1056.7 | 0 |
| 1056.75 | 0 |
| 1056.8 | 0 |
| 1056.85 | 0 |
| 1056.9 | 0 |
| 1056.95 | 0 |
| 1057.0 | 0 |
| 1057.05 | 0 |
| 1057.1 | 0 |
| 1057.15 | 0 |
| 1057.2 | 0 |
| 1057.25 | 0 |
| 1057.3 | 0 |
| 1057.35 | 0 |
| 1057.4 | 0 |
| 1057.45 | 0 |
| 1057.5 | 0 |
| 1057.55 | 0 |
| 1057.6 | 0 |
| 1057.65 | 0 |
| 1057.7 | 0 |
| 1057.75 | 0 |
| 1057.8 | 0 |
| 1057.85 | 0 |
| 1057.9 | 0 |
| 1057.95 | 0 |
| 1058.0 | 0 |
| 1058.05 | 0 |
| 1058.1 | 0 |
| 1058.15 | 0 |
| 1058.2 | 0 |
| 1058.25 | 0 |
| 1058.3 | 0 |
| 1058.35 | 0 |
| 1058.4 | 0 |
| 1058.45 | 0 |
| 1058.5 | 0 |
| 1058.55 | 0 |
| 1058.6 | 0 |
| 1058.65 | 0 |
| 1058.7 | 0 |
| 1058.75 | 0 |
| 1058.8 | 0 |
| 1058.85 | 0 |
| 1058.9 | 0 |
| 1058.95 | 0 |
| 1059.0 | 0 |
| 1059.05 | 0 |
| 1059.1 | 0 |
| 1059.15 | 0 |
| 1059.2 | 0 |
| 1059.25 | 0 |
| 1059.3 | 0 |
| 1059.35 | 0 |
| 1059.4 | 0 |
| 1059.45 | 0 |
| 1059.5 | 0 |
| 1059.55 | 0 |
| 1059.6 | 0 |
| 1059.65 | 0 |
| 1059.7 | 0 |
| 1059.75 | 0 |
| 1059.8 | 0 |
| 1059.85 | 0 |
| 1059.9 | 0 |
| 1059.95 | 0 |
| 1060.0 | 0 |
| 1060.05 | 0 |
| 1060.1 | 0 |
| 1060.15 | 0 |
| 1060.2 | 0 |
| 1060.25 | 0 |
| 1060.3 | 0 |
| 1060.35 | 0 |
| 1060.4 | 0 |
| 1060.45 | 0 |
| 1060.5 | 0 |
| 1060.55 | 0 |
| 1060.6 | 0 |
| 1060.65 | 0 |
| 1060.7 | 0 |
| 1060.75 | 0 |
| 1060.8 | 0 |
| 1060.85 | 0 |
| 1060.9 | 0 |
| 1060.95 | 0 |
| 1061.0 | 0 |
| 1061.05 | 0 |
| 1061.1 | 0 |
| 1061.15 | 0 |
| 1061.2 | 0 |
| 1061.25 | 0 |
| 1061.3 | 0 |
| 1061.35 | 0 |
| 1061.4 | 0 |
| 1061.45 | 0 |
| 1061.5 | 0 |
| 1061.55 | 0 |
| 1061.6 | 0 |
| 1061.65 | 0 |
| 1061.7 | 0 |
| 1061.75 | 0 |
| 1061.8 | 0 |
| 1061.85 | 0 |
| 1061.9 | 0 |
| 1061.95 | 0 |
| 1062.0 | 0 |
| 1062.05 | 0 |
| 1062.1 | 0 |
| 1062.15 | 0 |
| 1062.2 | 0 |
| 1062.25 | 0 |
| 1062.3 | 0 |
| 1062.35 | 0 |
| 1062.4 | 0 |
| 1062.45 | 0 |
| 1062.5 | 0 |
| 1062.55 | 0 |
| 1062.6 | 0 |
| 1062.65 | 0 |
| 1062.7 | 0 |
| 1062.75 | 0 |
| 1062.8 | 0 |
| 1062.85 | 0 |
| 1062.9 | 0 |
| 1062.95 | 0 |
| 1063.0 | 0 |
| 1063.05 | 0 |
| 1063.1 | 0 |
| 1063.15 | 0 |
| 1063.2 | 0 |
| 1063.25 | 0 |
| 1063.3 | 0 |
| 1063.35 | 0 |
| 1063.4 | 0 |
| 1063.45 | 0 |
| 1063.5 | 0 |
| 1063.55 | 0 |
| 1063.6 | 0 |
| 1063.65 | 0 |
| 1063.7 | 0 |
| 1063.75 | 0 |
| 1063.8 | 0 |
| 1063.85 | 0 |
| 1063.9 | 0 |
| 1063.95 | 0 |
| 1064.0 | 0 |
| 1064.05 | 0 |
| 1064.1 | 0 |
| 1064.15 | 0 |
| 1064.2 | 0 |
| 1064.25 | 0 |
| 1064.3 | 0 |
| 1064.35 | 0 |
| 1064.4 | 0 |
| 1064.45 | 0 |
| 1064.5 | 0 |
| 1064.55 | 0 |
| 1064.6 | 0 |
| 1064.65 | 0 |
| 1064.7 | 0 |
| 1064.75 | 0 |
| 1064.8 | 0 |
| 1064.85 | 0 |
| 1064.9 | 0 |
| 1064.95 | 0 |
| 1065.0 | 0 |
| 1065.05 | 0 |
| 1065.1 | 0 |
| 1065.15 | 0 |
| 1065.2 | 0 |
| 1065.25 | 0 |
| 1065.3 | 0 |
| 1065.35 | 0 |
| 1065.4 | 0 |
| 1065.45 | 0 |
| 1065.5 | 0 |
| 1065.55 | 0 |
| 1065.6 | 0 |
| 1065.65 | 0 |
| 1065.7 | 0 |
| 1065.75 | 0 |
| 1065.8 | 0 |
| 1065.85 | 0 |
| 1065.9 | 0 |
| 1065.95 | 0 |
| 1066.0 | 0 |
| 1066.05 | 0 |
| 1066.1 | 0 |
| 1066.15 | 0 |
| 1066.2 | 0 |
| 1066.25 | 0 |
| 1066.3 | 0 |
| 1066.35 | 0 |
| 1066.4 | 0 |
| 1066.45 | 0 |
| 1066.5 | 0 |
| 1066.55 | 0 |
| 1066.6 | 0 |
| 1066.65 | 0 |
| 1066.7 | 0 |
| 1066.75 | 0 |
| 1066.8 | 0 |
| 1066.85 | 0 |
| 1066.9 | 0 |
| 1066.95 | 0 |
| 1067.0 | 0 |
| 1067.05 | 0 |
| 1067.1 | 0 |
| 1067.15 | 0 |
| 1067.2 | 0 |
| 1067.25 | 0 |
| 1067.3 | 0 |
| 1067.35 | 0 |
| 1067.4 | 0 |
| 1067.45 | 0 |
| 1067.5 | 0 |
| 1067.55 | 0 |
| 1067.6 | 0 |
| 1067.65 | 0 |
| 1067.7 | 0 |
| 1067.75 | 0 |
| 1067.8 | 0 |
| 1067.85 | 0 |
| 1067.9 | 0 |
| 1067.95 | 0 |
| 1068.0 | 0 |
| 1068.05 | 0 |
| 1068.1 | 0 |
| 1068.15 | 0 |
| 1068.2 | 0 |
| 1068.25 | 0 |
| 1068.3 | 0 |
| 1068.35 | 0 |
| 1068.4 | 0 |
| 1068.45 | 0 |
| 1068.5 | 0 |
| 1068.55 | 0 |
| 1068.6 | 0 |
| 1068.65 | 0 |
| 1068.7 | 0 |
| 1068.75 | 0 |
| 1068.8 | 0 |
| 1068.85 | 0 |
| 1068.9 | 0 |
| 1068.95 | 0 |
| 1069.0 | 0 |
| 1069.05 | 0 |
| 1069.1 | 0 |
| 1069.15 | 0 |
| 1069.2 | 0 |
| 1069.25 | 0 |
| 1069.3 | 0 |
| 1069.35 | 0 |
| 1069.4 | 0 |
| 1069.45 | 0 |
| 1069.5 | 0 |
| 1069.55 | 0 |
| 1069.6 | 0 |
| 1069.65 | 0 |
| 1069.7 | 0 |
| 1069.75 | 0 |
| 1069.8 | 0 |
| 1069.85 | 0 |
| 1069.9 | 0 |
| 1069.95 | 0 |
| 1070.0 | 0 |
| 1070.05 | 0 |
| 1070.1 | 0 |
| 1070.15 | 0 |
| 1070.2 | 0 |
| 1070.25 | 0 |
| 1070.3 | 0 |
| 1070.35 | 0 |
| 1070.4 | 0 |
| 1070.45 | 0 |
| 1070.5 | 0 |
| 1070.55 | 0 |
| 1070.6 | 0 |
| 1070.65 | 0 |
| 1070.7 | 0 |
| 1070.75 | 0 |
| 1070.8 | 0 |
| 1070.85 | 0 |
| 1070.9 | 0 |
| 1070.95 | 0 |
| 1071.0 | 0 |
| 1071.05 | 0 |
| 1071.1 | 0 |
| 1071.15 | 0 |
| 1071.2 | 0 |
| 1071.25 | 0 |
| 1071.3 | 0 |
| 1071.35 | 0 |
| 1071.4 | 0 |
| 1071.45 | 0 |
| 1071.5 | 0 |
| 1071.55 | 0 |
| 1071.6 | 0 |
| 1071.65 | 0 |
| 1071.7 | 0 |
| 1071.75 | 0 |
| 1071.8 | 0 |
| 1071.85 | 0 |
| 1071.9 | 0 |
| 1071.95 | 0 |
| 1072.0 | 0 |
| 1072.05 | 0 |
| 1072.1 | 0 |
| 1072.15 | 0 |
| 1072.2 | 0 |
| 1072.25 | 0 |
| 1072.3 | 0 |
| 1072.35 | 0 |
| 1072.4 | 0 |
| 1072.45 | 0 |
| 1072.5 | 0 |
| 1072.55 | 0 |
| 1072.6 | 0 |
| 1072.65 | 0 |
| 1072.7 | 0 |
| 1072.75 | 0 |
| 1072.8 | 0 |
| 1072.85 | 0 |
| 1072.9 | 0 |
| 1072.95 | 0 |
| 1073.0 | 0 |
| 1073.05 | 0 |
| 1073.1 | 0 |
| 1073.15 | 0 |
| 1073.2 | 0 |
| 1073.25 | 0 |
| 1073.3 | 0 |
| 1073.35 | 0 |
| 1073.4 | 0 |
| 1073.45 | 0 |
| 1073.5 | 0 |
| 1073.55 | 0 |
| 1073.6 | 0 |
| 1073.65 | 0 |
| 1073.7 | 0 |
| 1073.75 | 0 |
| 1073.8 | 0 |
| 1073.85 | 0 |
| 1073.9 | 0 |
| 1073.95 | 0 |
| 1074.0 | 0 |
| 1074.05 | 0 |
| 1074.1 | 0 |
| 1074.15 | 0 |
| 1074.2 | 0 |
| 1074.25 | 0 |
| 1074.3 | 0 |
| 1074.35 | 0 |
| 1074.4 | 0 |
| 1074.45 | 0 |
| 1074.5 | 0 |
| 1074.55 | 0 |
| 1074.6 | 0 |
| 1074.65 | 0 |
| 1074.7 | 0 |
| 1074.75 | 0 |
| 1074.8 | 0 |
| 1074.85 | 0 |
| 1074.9 | 0 |
| 1074.95 | 0 |
| 1075.0 | 0 |
| 1075.05 | 0 |
| 1075.1 | 0 |
| 1075.15 | 0 |
| 1075.2 | 0 |
| 1075.25 | 0 |
| 1075.3 | 0 |
| 1075.35 | 0 |
| 1075.4 | 0 |
| 1075.45 | 0 |
| 1075.5 | 0 |
| 1075.55 | 0 |
| 1075.6 | 0 |
| 1075.65 | 0 |
| 1075.7 | 0 |
| 1075.75 | 0 |
| 1075.8 | 0 |
| 1075.85 | 0 |
| 1075.9 | 0 |
| 1075.95 | 0 |
| 1076.0 | 0 |
| 1076.05 | 0 |
| 1076.1 | 0 |
| 1076.15 | 0 |
| 1076.2 | 0 |
| 1076.25 | 0 |
| 1076.3 | 0 |
| 1076.35 | 0 |
| 1076.4 | 0 |
| 1076.45 | 0 |
| 1076.5 | 0 |
| 1076.55 | 0 |
| 1076.6 | 0 |
| 1076.65 | 0 |
| 1076.7 | 0 |
| 1076.75 | 0 |
| 1076.8 | 0 |
| 1076.85 | 0 |
| 1076.9 | 0 |
| 1076.95 | 0 |
| 1077.0 | 0 |
| 1077.05 | 0 |
| 1077.1 | 0 |
| 1077.15 | 0 |
| 1077.2 | 0 |
| 1077.25 | 0 |
| 1077.3 | 0 |
| 1077.35 | 0 |
| 1077.4 | 0 |
| 1077.45 | 0 |
| 1077.5 | 0 |
| 1077.55 | 0 |
| 1077.6 | 0 |
| 1077.65 | 0 |
| 1077.7 | 0 |
| 1077.75 | 0 |
| 1077.8 | 0 |
| 1077.85 | 0 |
| 1077.9 | 0 |
| 1077.95 | 0 |
| 1078.0 | 0 |
| 1078.05 | 0 |
| 1078.1 | 0 |
| 1078.15 | 0 |
| 1078.2 | 0 |
| 1078.25 | 0 |
| 1078.3 | 0 |
| 1078.35 | 0 |
| 1078.4 | 0 |
| 1078.45 | 0 |
| 1078.5 | 0 |
| 1078.55 | 0 |
| 1078.6 | 0 |
| 1078.65 | 0 |
| 1078.7 | 0 |
| 1078.75 | 0 |
| 1078.8 | 0 |
| 1078.85 | 0 |
| 1078.9 | 0 |
| 1078.95 | 0 |
| 1079.0 | 0 |
| 1079.05 | 0 |
| 1079.1 | 0 |
| 1079.15 | 0 |
| 1079.2 | 0 |
| 1079.25 | 0 |
| 1079.3 | 0 |
| 1079.35 | 0 |
| 1079.4 | 0 |
| 1079.45 | 0 |
| 1079.5 | 0 |
| 1079.55 | 0 |
| 1079.6 | 0 |
| 1079.65 | 0 |
| 1079.7 | 0 |
| 1079.75 | 0 |
| 1079.8 | 0 |
| 1079.85 | 0 |
| 1079.9 | 0 |
| 1079.95 | 0 |
| 1080.0 | 0 |
| 1080.05 | 0 |
| 1080.1 | 0 |
| 1080.15 | 0 |
| 1080.2 | 0 |
| 1080.25 | 0 |
| 1080.3 | 0 |
| 1080.35 | 0 |
| 1080.4 | 0 |
| 1080.45 | 0 |
| 1080.5 | 0 |
| 1080.55 | 0 |
| 1080.6 | 0 |
| 1080.65 | 0 |
| 1080.7 | 0 |
| 1080.75 | 0 |
| 1080.8 | 0 |
| 1080.85 | 0 |
| 1080.9 | 0 |
| 1080.95 | 0 |
| 1081.0 | 0 |
| 1081.05 | 0 |
| 1081.1 | 0 |
| 1081.15 | 0 |
| 1081.2 | 0 |
| 1081.25 | 0 |
| 1081.3 | 0 |
| 1081.35 | 0 |
| 1081.4 | 0 |
| 1081.45 | 0 |
| 1081.5 | 0 |
| 1081.55 | 0 |
| 1081.6 | 0 |
| 1081.65 | 0 |
| 1081.7 | 0 |
| 1081.75 | 0 |
| 1081.8 | 0 |
| 1081.85 | 0 |
| 1081.9 | 0 |
| 1081.95 | 0 |
| 1082.0 | 0 |
| 1082.05 | 0 |
| 1082.1 | 0 |
| 1082.15 | 0 |
| 1082.2 | 0 |
| 1082.25 | 0 |
| 1082.3 | 0 |
| 1082.35 | 0 |
| 1082.4 | 0 |
| 1082.45 | 0 |
| 1082.5 | 0 |
| 1082.55 | 0 |
| 1082.6 | 0 |
| 1082.65 | 0 |
| 1082.7 | 0 |
| 1082.75 | 0 |
| 1082.8 | 0 |
| 1082.85 | 0 |
| 1082.9 | 0 |
| 1082.95 | 0 |
| 1083.0 | 0 |
| 1083.05 | 0 |
| 1083.1 | 0 |
| 1083.15 | 0 |
| 1083.2 | 0 |
| 1083.25 | 0 |
| 1083.3 | 0 |
| 1083.35 | 0 |
| 1083.4 | 0 |
| 1083.45 | 0 |
| 1083.5 | 0 |
| 1083.55 | 0 |
| 1083.6 | 0 |
| 1083.65 | 0 |
| 1083.7 | 0 |
| 1083.75 | 0 |
| 1083.8 | 0 |
| 1083.85 | 0 |
| 1083.9 | 0 |
| 1083.95 | 0 |
| 1084.0 | 0 |
| 1084.05 | 0 |
| 1084.1 | 0 |
| 1084.15 | 0 |
| 1084.2 | 0 |
| 1084.25 | 0 |
| 1084.3 | 0 |
| 1084.35 | 0 |
| 1084.4 | 0 |
| 1084.45 | 0 |
| 1084.5 | 0 |
| 1084.55 | 0 |
| 1084.6 | 0 |
| 1084.65 | 0 |
| 1084.7 | 0 |
| 1084.75 | 0 |
| 1084.8 | 0 |
| 1084.85 | 0 |
| 1084.9 | 0 |
| 1084.95 | 0 |
| 1085.0 | 0 |
| 1085.05 | 0 |
| 1085.1 | 0 |
| 1085.15 | 0 |
| 1085.2 | 0 |
| 1085.25 | 0 |
| 1085.3 | 0 |
| 1085.35 | 0 |
| 1085.4 | 0 |
| 1085.45 | 0 |
| 1085.5 | 0 |
| 1085.55 | 0 |
| 1085.6 | 0 |
| 1085.65 | 0 |
| 1085.7 | 0 |
| 1085.75 | 0 |
| 1085.8 | 0 |
| 1085.85 | 0 |
| 1085.9 | 0 |
| 1085.95 | 0 |
| 1086.0 | 0 |
| 1086.05 | 0 |
| 1086.1 | 0 |
| 1086.15 | 0 |
| 1086.2 | 0 |
| 1086.25 | 0 |
| 1086.3 | 0 |
| 1086.35 | 0 |
| 1086.4 | 0 |
| 1086.45 | 0 |
| 1086.5 | 0 |
| 1086.55 | 0 |
| 1086.6 | 0 |
| 1086.65 | 0 |
| 1086.7 | 0 |
| 1086.75 | 0 |
| 1086.8 | 0 |
| 1086.85 | 0 |
| 1086.9 | 0 |
| 1086.95 | 0 |
| 1087.0 | 0 |
| 1087.05 | 0 |
| 1087.1 | 0 |
| 1087.15 | 0 |
| 1087.2 | 0 |
| 1087.25 | 0 |
| 1087.3 | 0 |
| 1087.35 | 0 |
| 1087.4 | 0 |
| 1087.45 | 0 |
| 1087.5 | 0 |
| 1087.55 | 0 |
| 1087.6 | 0 |
| 1087.65 | 0 |
| 1087.7 | 0 |
| 1087.75 | 0 |
| 1087.8 | 0 |
| 1087.85 | 0 |
| 1087.9 | 0 |
| 1087.95 | 0 |
| 1088.0 | 0 |
| 1088.05 | 0 |
| 1088.1 | 0 |
| 1088.15 | 0 |
| 1088.2 | 0 |
| 1088.25 | 0 |
| 1088.3 | 0 |
| 1088.35 | 0 |
| 1088.4 | 0 |
| 1088.45 | 0 |
| 1088.5 | 0 |
| 1088.55 | 0 |
| 1088.6 | 0 |
| 1088.65 | 0 |
| 1088.7 | 0 |
| 1088.75 | 0 |
| 1088.8 | 0 |
| 1088.85 | 0 |
| 1088.9 | 0 |
| 1088.95 | 0 |
| 1089.0 | 0 |
| 1089.05 | 0 |
| 1089.1 | 0 |
| 1089.15 | 0 |
| 1089.2 | 0 |
| 1089.25 | 0 |
| 1089.3 | 0 |
| 1089.35 | 0 |
| 1089.4 | 0 |
| 1089.45 | 0 |
| 1089.5 | 0 |
| 1089.55 | 0 |
| 1089.6 | 0 |
| 1089.65 | 0 |
| 1089.7 | 0 |
| 1089.75 | 0 |
| 1089.8 | 0 |
| 1089.85 | 0 |
| 1089.9 | 0 |
| 1089.95 | 0 |
| 1090.0 | 0 |
| 1090.05 | 0 |
| 1090.1 | 0 |
| 1090.15 | 0 |
| 1090.2 | 0 |
| 1090.25 | 0 |
| 1090.3 | 0 |
| 1090.35 | 0 |
| 1090.4 | 0 |
| 1090.45 | 0 |
| 1090.5 | 0 |
| 1090.55 | 0 |
| 1090.6 | 0 |
| 1090.65 | 0 |
| 1090.7 | 0 |
| 1090.75 | 0 |
| 1090.8 | 0 |
| 1090.85 | 0 |
| 1090.9 | 0 |
| 1090.95 | 0 |
| 1091.0 | 0 |
| 1091.05 | 0 |
| 1091.1 | 0 |
| 1091.15 | 0 |
| 1091.2 | 0 |
| 1091.25 | 0 |
| 1091.3 | 0 |
| 1091.35 | 0 |
| 1091.4 | 0 |
| 1091.45 | 0 |
| 1091.5 | 0 |
| 1091.55 | 0 |
| 1091.6 | 0 |
| 1091.65 | 0 |
| 1091.7 | 0 |
| 1091.75 | 0 |
| 1091.8 | 0 |
| 1091.85 | 0 |
| 1091.9 | 0 |
| 1091.95 | 0 |
| 1092.0 | 0 |
| 1092.05 | 0 |
| 1092.1 | 0 |
| 1092.15 | 0 |
| 1092.2 | 0 |
| 1092.25 | 0 |
| 1092.3 | 0 |
| 1092.35 | 0 |
| 1092.4 | 0 |
| 1092.45 | 0 |
| 1092.5 | 0 |
| 1092.55 | 0 |
| 1092.6 | 0 |
| 1092.65 | 0 |
| 1092.7 | 0 |
| 1092.75 | 0 |
| 1092.8 | 0 |
| 1092.85 | 0 |
| 1092.9 | 0 |
| 1092.95 | 0 |
| 1093.0 | 0 |
| 1093.05 | 0 |
| 1093.1 | 0 |
| 1093.15 | 0 |
| 1093.2 | 0 |
| 1093.25 | 0 |
| 1093.3 | 0 |
| 1093.35 | 0 |
| 1093.4 | 0 |
| 1093.45 | 0 |
| 1093.5 | 0 |
| 1093.55 | 0 |
| 1093.6 | 0 |
| 1093.65 | 0 |
| 1093.7 | 0 |
| 1093.75 | 0 |
| 1093.8 | 0 |
| 1093.85 | 0 |
| 1093.9 | 0 |
| 1093.95 | 0 |
| 1094.0 | 0 |
| 1094.05 | 0 |
| 1094.1 | 0 |
| 1094.15 | 0 |
| 1094.2 | 0 |
| 1094.25 | 0 |
| 1094.3 | 0 |
| 1094.35 | 0 |
| 1094.4 | 0 |
| 1094.45 | 0 |
| 1094.5 | 0 |
| 1094.55 | 0 |
| 1094.6 | 0 |
| 1094.65 | 0 |
| 1094.7 | 0 |
| 1094.75 | 0 |
| 1094.8 | 0 |
| 1094.85 | 0 |
| 1094.9 | 0 |
| 1094.95 | 0 |
| 1095.0 | 0 |
| 1095.05 | 0 |
| 1095.1 | 0 |
| 1095.15 | 0 |
| 1095.2 | 0 |
| 1095.25 | 0 |
| 1095.3 | 0 |
| 1095.35 | 0 |
| 1095.4 | 0 |
| 1095.45 | 0 |
| 1095.5 | 0 |
| 1095.55 | 0 |
| 1095.6 | 0 |
| 1095.65 | 0 |
| 1095.7 | 0 |
| 1095.75 | 0 |
| 1095.8 | 0 |
| 1095.85 | 0 |
| 1095.9 | 0 |
| 1095.95 | 0 |
| 1096.0 | 0 |
| 1096.05 | 0 |
| 1096.1 | 0 |
| 1096.15 | 0 |
| 1096.2 | 0 |
| 1096.25 | 0 |
| 1096.3 | 0 |
| 1096.35 | 0 |
| 1096.4 | 0 |
| 1096.45 | 0 |
| 1096.5 | 0 |
| 1096.55 | 0 |
| 1096.6 | 0 |
| 1096.65 | 0 |
| 1096.7 | 0 |
| 1096.75 | 0 |
| 1096.8 | 0 |
| 1096.85 | 0 |
| 1096.9 | 0 |
| 1096.95 | 0 |
| 1097.0 | 0 |
| 1097.05 | 0 |
| 1097.1 | 0 |
| 1097.15 | 0 |
| 1097.2 | 0 |
| 1097.25 | 0 |
| 1097.3 | 0 |
| 1097.35 | 0 |
| 1097.4 | 0 |
| 1097.45 | 0 |
| 1097.5 | 0 |
| 1097.55 | 0 |
| 1097.6 | 0 |
| 1097.65 | 0 |
| 1097.7 | 0 |
| 1097.75 | 0 |
| 1097.8 | 0 |
| 1097.85 | 0 |
| 1097.9 | 0 |
| 1097.95 | 0 |
| 1098.0 | 0 |
| 1098.05 | 0 |
| 1098.1 | 0 |
| 1098.15 | 0 |
| 1098.2 | 0 |
| 1098.25 | 0 |
| 1098.3 | 0 |
| 1098.35 | 0 |
| 1098.4 | 0 |
| 1098.45 | 0 |
| 1098.5 | 0 |
| 1098.55 | 0 |
| 1098.6 | 0 |
| 1098.65 | 0 |
| 1098.7 | 0 |
| 1098.75 | 0 |
| 1098.8 | 0 |
| 1098.85 | 0 |
| 1098.9 | 0 |
| 1098.95 | 0 |
| 1099.0 | 0 |
| 1099.05 | 0 |
| 1099.1 | 0 |
| 1099.15 | 0 |
| 1099.2 | 0 |
| 1099.25 | 0 |
| 1099.3 | 0 |
| 1099.35 | 0 |
| 1099.4 | 0 |
| 1099.45 | 0 |
| 1099.5 | 0 |
| 1099.55 | 0 |
| 1099.6 | 0 |
| 1099.65 | 0 |
| 1099.7 | 0 |
| 1099.75 | 0 |
| 1099.8 | 0 |
| 1099.85 | 0 |
| 1099.9 | 0 |
| 1099.95 | 0 |
| 1100.0 | 0 |